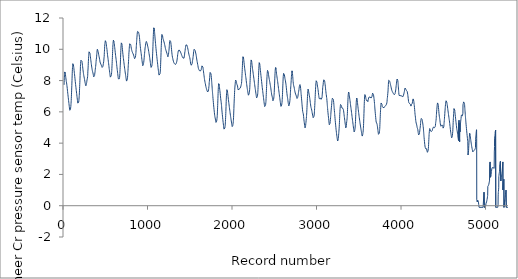
| Category | Series 0 |
|---|---|
| 0.0 | 7.725 |
| 1.0 | 7.857 |
| 2.0 | 7.993 |
| 3.0 | 8.11 |
| 4.0 | 8.21 |
| 5.0 | 8.3 |
| 6.0 | 8.38 |
| 7.0 | 8.47 |
| 8.0 | 8.55 |
| 9.0 | 8.58 |
| 10.0 | 8.59 |
| 11.0 | 8.58 |
| 12.0 | 8.56 |
| 13.0 | 8.54 |
| 14.0 | 8.51 |
| 15.0 | 8.46 |
| 16.0 | 8.42 |
| 17.0 | 8.37 |
| 18.0 | 8.32 |
| 19.0 | 8.28 |
| 20.0 | 8.23 |
| 21.0 | 8.18 |
| 22.0 | 8.14 |
| 23.0 | 8.1 |
| 24.0 | 8.06 |
| 25.0 | 8.02 |
| 26.0 | 7.978 |
| 27.0 | 7.944 |
| 28.0 | 7.92 |
| 29.0 | 7.887 |
| 30.0 | 7.851 |
| 31.0 | 7.811 |
| 32.0 | 7.771 |
| 33.0 | 7.726 |
| 34.0 | 7.677 |
| 35.0 | 7.631 |
| 36.0 | 7.593 |
| 37.0 | 7.552 |
| 38.0 | 7.498 |
| 39.0 | 7.445 |
| 40.0 | 7.392 |
| 41.0 | 7.342 |
| 42.0 | 7.293 |
| 43.0 | 7.244 |
| 44.0 | 7.194 |
| 45.0 | 7.146 |
| 46.0 | 7.098 |
| 47.0 | 7.051 |
| 48.0 | 7.004 |
| 49.0 | 6.956 |
| 50.0 | 6.908 |
| 51.0 | 6.861 |
| 52.0 | 6.814 |
| 53.0 | 6.767 |
| 54.0 | 6.719 |
| 55.0 | 6.672 |
| 56.0 | 6.626 |
| 57.0 | 6.579 |
| 58.0 | 6.533 |
| 59.0 | 6.484 |
| 60.0 | 6.436 |
| 61.0 | 6.388 |
| 62.0 | 6.344 |
| 63.0 | 6.296 |
| 64.0 | 6.253 |
| 65.0 | 6.208 |
| 66.0 | 6.165 |
| 67.0 | 6.127 |
| 68.0 | 6.1 |
| 69.0 | 6.097 |
| 70.0 | 6.098 |
| 71.0 | 6.104 |
| 72.0 | 6.11 |
| 73.0 | 6.117 |
| 74.0 | 6.13 |
| 75.0 | 6.15 |
| 76.0 | 6.174 |
| 77.0 | 6.206 |
| 78.0 | 6.244 |
| 79.0 | 6.286 |
| 80.0 | 6.339 |
| 81.0 | 6.4 |
| 82.0 | 6.472 |
| 83.0 | 6.548 |
| 84.0 | 6.636 |
| 85.0 | 6.738 |
| 86.0 | 6.864 |
| 87.0 | 6.996 |
| 88.0 | 7.128 |
| 89.0 | 7.258 |
| 90.0 | 7.39 |
| 91.0 | 7.53 |
| 92.0 | 7.677 |
| 93.0 | 7.839 |
| 94.0 | 7.999 |
| 95.0 | 8.15 |
| 96.0 | 8.3 |
| 97.0 | 8.47 |
| 98.0 | 8.6 |
| 99.0 | 8.72 |
| 100.0 | 8.83 |
| 101.0 | 8.91 |
| 102.0 | 8.98 |
| 103.0 | 9.04 |
| 104.0 | 9.08 |
| 105.0 | 9.11 |
| 106.0 | 9.12 |
| 107.0 | 9.11 |
| 108.0 | 9.09 |
| 109.0 | 9.07 |
| 110.0 | 9.04 |
| 111.0 | 9 |
| 112.0 | 8.96 |
| 113.0 | 8.92 |
| 114.0 | 8.89 |
| 115.0 | 8.84 |
| 116.0 | 8.8 |
| 117.0 | 8.75 |
| 118.0 | 8.7 |
| 119.0 | 8.64 |
| 120.0 | 8.59 |
| 121.0 | 8.54 |
| 122.0 | 8.49 |
| 123.0 | 8.45 |
| 124.0 | 8.41 |
| 125.0 | 8.36 |
| 126.0 | 8.31 |
| 127.0 | 8.25 |
| 128.0 | 8.2 |
| 129.0 | 8.15 |
| 130.0 | 8.09 |
| 131.0 | 8.04 |
| 132.0 | 7.984 |
| 133.0 | 7.934 |
| 134.0 | 7.886 |
| 135.0 | 7.84 |
| 136.0 | 7.79 |
| 137.0 | 7.741 |
| 138.0 | 7.692 |
| 139.0 | 7.644 |
| 140.0 | 7.596 |
| 141.0 | 7.549 |
| 142.0 | 7.5 |
| 143.0 | 7.453 |
| 144.0 | 7.408 |
| 145.0 | 7.361 |
| 146.0 | 7.316 |
| 147.0 | 7.27 |
| 148.0 | 7.223 |
| 149.0 | 7.177 |
| 150.0 | 7.133 |
| 151.0 | 7.087 |
| 152.0 | 7.04 |
| 153.0 | 6.994 |
| 154.0 | 6.949 |
| 155.0 | 6.902 |
| 156.0 | 6.857 |
| 157.0 | 6.811 |
| 158.0 | 6.765 |
| 159.0 | 6.721 |
| 160.0 | 6.676 |
| 161.0 | 6.632 |
| 162.0 | 6.592 |
| 163.0 | 6.557 |
| 164.0 | 6.53 |
| 165.0 | 6.524 |
| 166.0 | 6.524 |
| 167.0 | 6.531 |
| 168.0 | 6.538 |
| 169.0 | 6.548 |
| 170.0 | 6.56 |
| 171.0 | 6.58 |
| 172.0 | 6.603 |
| 173.0 | 6.629 |
| 174.0 | 6.666 |
| 175.0 | 6.707 |
| 176.0 | 6.757 |
| 177.0 | 6.815 |
| 178.0 | 6.887 |
| 179.0 | 6.961 |
| 180.0 | 7.042 |
| 181.0 | 7.141 |
| 182.0 | 7.259 |
| 183.0 | 7.385 |
| 184.0 | 7.507 |
| 185.0 | 7.63 |
| 186.0 | 7.757 |
| 187.0 | 7.888 |
| 188.0 | 8.02 |
| 189.0 | 8.16 |
| 190.0 | 8.33 |
| 191.0 | 8.48 |
| 192.0 | 8.59 |
| 193.0 | 8.74 |
| 194.0 | 8.9 |
| 195.0 | 9.01 |
| 196.0 | 9.09 |
| 197.0 | 9.14 |
| 198.0 | 9.21 |
| 199.0 | 9.25 |
| 200.0 | 9.3 |
| 201.0 | 9.31 |
| 202.0 | 9.33 |
| 203.0 | 9.35 |
| 204.0 | 9.36 |
| 205.0 | 9.36 |
| 206.0 | 9.36 |
| 207.0 | 9.35 |
| 208.0 | 9.33 |
| 209.0 | 9.32 |
| 210.0 | 9.3 |
| 211.0 | 9.26 |
| 212.0 | 9.23 |
| 213.0 | 9.19 |
| 214.0 | 9.15 |
| 215.0 | 9.1 |
| 216.0 | 9.06 |
| 217.0 | 9.02 |
| 218.0 | 8.97 |
| 219.0 | 8.92 |
| 220.0 | 8.88 |
| 221.0 | 8.83 |
| 222.0 | 8.79 |
| 223.0 | 8.74 |
| 224.0 | 8.69 |
| 225.0 | 8.65 |
| 226.0 | 8.61 |
| 227.0 | 8.57 |
| 228.0 | 8.53 |
| 229.0 | 8.49 |
| 230.0 | 8.45 |
| 231.0 | 8.41 |
| 232.0 | 8.38 |
| 233.0 | 8.34 |
| 234.0 | 8.31 |
| 235.0 | 8.29 |
| 236.0 | 8.26 |
| 237.0 | 8.23 |
| 238.0 | 8.2 |
| 239.0 | 8.18 |
| 240.0 | 8.15 |
| 241.0 | 8.12 |
| 242.0 | 8.09 |
| 243.0 | 8.06 |
| 244.0 | 8.03 |
| 245.0 | 8 |
| 246.0 | 7.965 |
| 247.0 | 7.929 |
| 248.0 | 7.899 |
| 249.0 | 7.875 |
| 250.0 | 7.851 |
| 251.0 | 7.82 |
| 252.0 | 7.79 |
| 253.0 | 7.76 |
| 254.0 | 7.731 |
| 255.0 | 7.711 |
| 256.0 | 7.698 |
| 257.0 | 7.683 |
| 258.0 | 7.667 |
| 259.0 | 7.667 |
| 260.0 | 7.667 |
| 261.0 | 7.69 |
| 262.0 | 7.709 |
| 263.0 | 7.721 |
| 264.0 | 7.747 |
| 265.0 | 7.779 |
| 266.0 | 7.817 |
| 267.0 | 7.856 |
| 268.0 | 7.883 |
| 269.0 | 7.92 |
| 270.0 | 7.963 |
| 271.0 | 7.988 |
| 272.0 | 8.04 |
| 273.0 | 8.07 |
| 274.0 | 8.09 |
| 275.0 | 8.1 |
| 276.0 | 8.15 |
| 277.0 | 8.19 |
| 278.0 | 8.21 |
| 279.0 | 8.25 |
| 280.0 | 8.34 |
| 281.0 | 8.47 |
| 282.0 | 8.6 |
| 283.0 | 8.65 |
| 284.0 | 8.74 |
| 285.0 | 8.86 |
| 286.0 | 8.96 |
| 287.0 | 9.11 |
| 288.0 | 9.22 |
| 289.0 | 9.31 |
| 290.0 | 9.42 |
| 291.0 | 9.53 |
| 292.0 | 9.61 |
| 293.0 | 9.68 |
| 294.0 | 9.75 |
| 295.0 | 9.8 |
| 296.0 | 9.84 |
| 297.0 | 9.86 |
| 298.0 | 9.86 |
| 299.0 | 9.86 |
| 300.0 | 9.85 |
| 301.0 | 9.86 |
| 302.0 | 9.86 |
| 303.0 | 9.84 |
| 304.0 | 9.82 |
| 305.0 | 9.79 |
| 306.0 | 9.76 |
| 307.0 | 9.73 |
| 308.0 | 9.69 |
| 309.0 | 9.65 |
| 310.0 | 9.61 |
| 311.0 | 9.56 |
| 312.0 | 9.52 |
| 313.0 | 9.48 |
| 314.0 | 9.43 |
| 315.0 | 9.39 |
| 316.0 | 9.34 |
| 317.0 | 9.3 |
| 318.0 | 9.26 |
| 319.0 | 9.21 |
| 320.0 | 9.17 |
| 321.0 | 9.13 |
| 322.0 | 9.09 |
| 323.0 | 9.05 |
| 324.0 | 9.01 |
| 325.0 | 8.97 |
| 326.0 | 8.93 |
| 327.0 | 8.9 |
| 328.0 | 8.86 |
| 329.0 | 8.83 |
| 330.0 | 8.79 |
| 331.0 | 8.76 |
| 332.0 | 8.72 |
| 333.0 | 8.69 |
| 334.0 | 8.66 |
| 335.0 | 8.64 |
| 336.0 | 8.62 |
| 337.0 | 8.6 |
| 338.0 | 8.57 |
| 339.0 | 8.55 |
| 340.0 | 8.53 |
| 341.0 | 8.51 |
| 342.0 | 8.49 |
| 343.0 | 8.46 |
| 344.0 | 8.43 |
| 345.0 | 8.41 |
| 346.0 | 8.38 |
| 347.0 | 8.35 |
| 348.0 | 8.32 |
| 349.0 | 8.29 |
| 350.0 | 8.27 |
| 351.0 | 8.24 |
| 352.0 | 8.23 |
| 353.0 | 8.21 |
| 354.0 | 8.2 |
| 355.0 | 8.19 |
| 356.0 | 8.2 |
| 357.0 | 8.23 |
| 358.0 | 8.24 |
| 359.0 | 8.25 |
| 360.0 | 8.29 |
| 361.0 | 8.32 |
| 362.0 | 8.37 |
| 363.0 | 8.41 |
| 364.0 | 8.44 |
| 365.0 | 8.49 |
| 366.0 | 8.52 |
| 367.0 | 8.56 |
| 368.0 | 8.63 |
| 369.0 | 8.69 |
| 370.0 | 8.73 |
| 371.0 | 8.77 |
| 372.0 | 8.83 |
| 373.0 | 8.89 |
| 374.0 | 8.91 |
| 375.0 | 8.96 |
| 376.0 | 9 |
| 377.0 | 9.07 |
| 378.0 | 9.14 |
| 379.0 | 9.22 |
| 380.0 | 9.24 |
| 381.0 | 9.33 |
| 382.0 | 9.37 |
| 383.0 | 9.38 |
| 384.0 | 9.45 |
| 385.0 | 9.51 |
| 386.0 | 9.56 |
| 387.0 | 9.65 |
| 388.0 | 9.73 |
| 389.0 | 9.8 |
| 390.0 | 9.85 |
| 391.0 | 9.89 |
| 392.0 | 9.92 |
| 393.0 | 9.95 |
| 394.0 | 10 |
| 395.0 | 9.98 |
| 396.0 | 9.97 |
| 397.0 | 9.96 |
| 398.0 | 9.95 |
| 399.0 | 9.94 |
| 400.0 | 9.92 |
| 401.0 | 9.91 |
| 402.0 | 9.88 |
| 403.0 | 9.85 |
| 404.0 | 9.82 |
| 405.0 | 9.79 |
| 406.0 | 9.76 |
| 407.0 | 9.74 |
| 408.0 | 9.71 |
| 409.0 | 9.68 |
| 410.0 | 9.66 |
| 411.0 | 9.63 |
| 412.0 | 9.6 |
| 413.0 | 9.58 |
| 414.0 | 9.55 |
| 415.0 | 9.52 |
| 416.0 | 9.5 |
| 417.0 | 9.47 |
| 418.0 | 9.44 |
| 419.0 | 9.41 |
| 420.0 | 9.38 |
| 421.0 | 9.36 |
| 422.0 | 9.33 |
| 423.0 | 9.3 |
| 424.0 | 9.26 |
| 425.0 | 9.23 |
| 426.0 | 9.19 |
| 427.0 | 9.17 |
| 428.0 | 9.15 |
| 429.0 | 9.13 |
| 430.0 | 9.12 |
| 431.0 | 9.1 |
| 432.0 | 9.09 |
| 433.0 | 9.08 |
| 434.0 | 9.07 |
| 435.0 | 9.06 |
| 436.0 | 9.05 |
| 437.0 | 9.04 |
| 438.0 | 9.03 |
| 439.0 | 9.01 |
| 440.0 | 8.99 |
| 441.0 | 8.98 |
| 442.0 | 8.97 |
| 443.0 | 8.95 |
| 444.0 | 8.94 |
| 445.0 | 8.92 |
| 446.0 | 8.91 |
| 447.0 | 8.9 |
| 448.0 | 8.89 |
| 449.0 | 8.88 |
| 450.0 | 8.86 |
| 451.0 | 8.84 |
| 452.0 | 8.84 |
| 453.0 | 8.84 |
| 454.0 | 8.84 |
| 455.0 | 8.86 |
| 456.0 | 8.86 |
| 457.0 | 8.87 |
| 458.0 | 8.88 |
| 459.0 | 8.9 |
| 460.0 | 8.91 |
| 461.0 | 8.93 |
| 462.0 | 8.97 |
| 463.0 | 9 |
| 464.0 | 9.05 |
| 465.0 | 9.08 |
| 466.0 | 9.08 |
| 467.0 | 9.1 |
| 468.0 | 9.14 |
| 469.0 | 9.2 |
| 470.0 | 9.25 |
| 471.0 | 9.31 |
| 472.0 | 9.38 |
| 473.0 | 9.45 |
| 474.0 | 9.48 |
| 475.0 | 9.53 |
| 476.0 | 9.67 |
| 477.0 | 9.78 |
| 478.0 | 9.87 |
| 479.0 | 9.97 |
| 480.0 | 10.07 |
| 481.0 | 10.17 |
| 482.0 | 10.29 |
| 483.0 | 10.33 |
| 484.0 | 10.36 |
| 485.0 | 10.41 |
| 486.0 | 10.46 |
| 487.0 | 10.49 |
| 488.0 | 10.51 |
| 489.0 | 10.55 |
| 490.0 | 10.58 |
| 491.0 | 10.6 |
| 492.0 | 10.6 |
| 493.0 | 10.58 |
| 494.0 | 10.55 |
| 495.0 | 10.52 |
| 496.0 | 10.49 |
| 497.0 | 10.45 |
| 498.0 | 10.41 |
| 499.0 | 10.37 |
| 500.0 | 10.33 |
| 501.0 | 10.28 |
| 502.0 | 10.23 |
| 503.0 | 10.18 |
| 504.0 | 10.14 |
| 505.0 | 10.11 |
| 506.0 | 10.08 |
| 507.0 | 10.05 |
| 508.0 | 9.99 |
| 509.0 | 9.93 |
| 510.0 | 9.88 |
| 511.0 | 9.83 |
| 512.0 | 9.78 |
| 513.0 | 9.73 |
| 514.0 | 9.68 |
| 515.0 | 9.63 |
| 516.0 | 9.58 |
| 517.0 | 9.54 |
| 518.0 | 9.5 |
| 519.0 | 9.46 |
| 520.0 | 9.42 |
| 521.0 | 9.38 |
| 522.0 | 9.34 |
| 523.0 | 9.29 |
| 524.0 | 9.24 |
| 525.0 | 9.19 |
| 526.0 | 9.15 |
| 527.0 | 9.11 |
| 528.0 | 9.07 |
| 529.0 | 9.02 |
| 530.0 | 8.97 |
| 531.0 | 8.92 |
| 532.0 | 8.88 |
| 533.0 | 8.83 |
| 534.0 | 8.78 |
| 535.0 | 8.74 |
| 536.0 | 8.7 |
| 537.0 | 8.66 |
| 538.0 | 8.62 |
| 539.0 | 8.58 |
| 540.0 | 8.53 |
| 541.0 | 8.49 |
| 542.0 | 8.45 |
| 543.0 | 8.41 |
| 544.0 | 8.37 |
| 545.0 | 8.33 |
| 546.0 | 8.29 |
| 547.0 | 8.25 |
| 548.0 | 8.22 |
| 549.0 | 8.21 |
| 550.0 | 8.2 |
| 551.0 | 8.2 |
| 552.0 | 8.2 |
| 553.0 | 8.2 |
| 554.0 | 8.21 |
| 555.0 | 8.22 |
| 556.0 | 8.23 |
| 557.0 | 8.25 |
| 558.0 | 8.28 |
| 559.0 | 8.32 |
| 560.0 | 8.35 |
| 561.0 | 8.4 |
| 562.0 | 8.45 |
| 563.0 | 8.51 |
| 564.0 | 8.58 |
| 565.0 | 8.65 |
| 566.0 | 8.76 |
| 567.0 | 8.87 |
| 568.0 | 8.98 |
| 569.0 | 9.09 |
| 570.0 | 9.22 |
| 571.0 | 9.35 |
| 572.0 | 9.46 |
| 573.0 | 9.6 |
| 574.0 | 9.73 |
| 575.0 | 9.86 |
| 576.0 | 9.98 |
| 577.0 | 10.1 |
| 578.0 | 10.21 |
| 579.0 | 10.3 |
| 580.0 | 10.38 |
| 581.0 | 10.44 |
| 582.0 | 10.5 |
| 583.0 | 10.54 |
| 584.0 | 10.58 |
| 585.0 | 10.61 |
| 586.0 | 10.59 |
| 587.0 | 10.59 |
| 588.0 | 10.55 |
| 589.0 | 10.52 |
| 590.0 | 10.5 |
| 591.0 | 10.47 |
| 592.0 | 10.43 |
| 593.0 | 10.4 |
| 594.0 | 10.36 |
| 595.0 | 10.31 |
| 596.0 | 10.27 |
| 597.0 | 10.23 |
| 598.0 | 10.18 |
| 599.0 | 10.14 |
| 600.0 | 10.1 |
| 601.0 | 10.05 |
| 602.0 | 10 |
| 603.0 | 9.95 |
| 604.0 | 9.9 |
| 605.0 | 9.85 |
| 606.0 | 9.8 |
| 607.0 | 9.75 |
| 608.0 | 9.7 |
| 609.0 | 9.66 |
| 610.0 | 9.61 |
| 611.0 | 9.57 |
| 612.0 | 9.52 |
| 613.0 | 9.48 |
| 614.0 | 9.44 |
| 615.0 | 9.4 |
| 616.0 | 9.36 |
| 617.0 | 9.31 |
| 618.0 | 9.27 |
| 619.0 | 9.23 |
| 620.0 | 9.18 |
| 621.0 | 9.14 |
| 622.0 | 9.08 |
| 623.0 | 9.01 |
| 624.0 | 8.96 |
| 625.0 | 8.91 |
| 626.0 | 8.85 |
| 627.0 | 8.81 |
| 628.0 | 8.76 |
| 629.0 | 8.72 |
| 630.0 | 8.68 |
| 631.0 | 8.63 |
| 632.0 | 8.58 |
| 633.0 | 8.54 |
| 634.0 | 8.49 |
| 635.0 | 8.45 |
| 636.0 | 8.4 |
| 637.0 | 8.36 |
| 638.0 | 8.31 |
| 639.0 | 8.27 |
| 640.0 | 8.23 |
| 641.0 | 8.18 |
| 642.0 | 8.15 |
| 643.0 | 8.11 |
| 644.0 | 8.07 |
| 645.0 | 8.06 |
| 646.0 | 8.06 |
| 647.0 | 8.05 |
| 648.0 | 8.05 |
| 649.0 | 8.05 |
| 650.0 | 8.05 |
| 651.0 | 8.05 |
| 652.0 | 8.06 |
| 653.0 | 8.07 |
| 654.0 | 8.09 |
| 655.0 | 8.12 |
| 656.0 | 8.15 |
| 657.0 | 8.19 |
| 658.0 | 8.24 |
| 659.0 | 8.3 |
| 660.0 | 8.36 |
| 661.0 | 8.45 |
| 662.0 | 8.56 |
| 663.0 | 8.7 |
| 664.0 | 8.82 |
| 665.0 | 8.94 |
| 666.0 | 9.06 |
| 667.0 | 9.19 |
| 668.0 | 9.33 |
| 669.0 | 9.49 |
| 670.0 | 9.64 |
| 671.0 | 9.78 |
| 672.0 | 9.91 |
| 673.0 | 10.03 |
| 674.0 | 10.14 |
| 675.0 | 10.23 |
| 676.0 | 10.3 |
| 677.0 | 10.36 |
| 678.0 | 10.41 |
| 679.0 | 10.45 |
| 680.0 | 10.47 |
| 681.0 | 10.47 |
| 682.0 | 10.46 |
| 683.0 | 10.42 |
| 684.0 | 10.39 |
| 685.0 | 10.34 |
| 686.0 | 10.28 |
| 687.0 | 10.23 |
| 688.0 | 10.17 |
| 689.0 | 10.11 |
| 690.0 | 10.05 |
| 691.0 | 10 |
| 692.0 | 9.94 |
| 693.0 | 9.88 |
| 694.0 | 9.83 |
| 695.0 | 9.77 |
| 696.0 | 9.72 |
| 697.0 | 9.67 |
| 698.0 | 9.61 |
| 699.0 | 9.57 |
| 700.0 | 9.52 |
| 701.0 | 9.48 |
| 702.0 | 9.44 |
| 703.0 | 9.4 |
| 704.0 | 9.35 |
| 705.0 | 9.31 |
| 706.0 | 9.26 |
| 707.0 | 9.22 |
| 708.0 | 9.17 |
| 709.0 | 9.13 |
| 710.0 | 9.09 |
| 711.0 | 9.05 |
| 712.0 | 9 |
| 713.0 | 8.96 |
| 714.0 | 8.91 |
| 715.0 | 8.87 |
| 716.0 | 8.83 |
| 717.0 | 8.79 |
| 718.0 | 8.75 |
| 719.0 | 8.71 |
| 720.0 | 8.67 |
| 721.0 | 8.63 |
| 722.0 | 8.59 |
| 723.0 | 8.55 |
| 724.0 | 8.52 |
| 725.0 | 8.48 |
| 726.0 | 8.44 |
| 727.0 | 8.4 |
| 728.0 | 8.37 |
| 729.0 | 8.33 |
| 730.0 | 8.29 |
| 731.0 | 8.25 |
| 732.0 | 8.22 |
| 733.0 | 8.18 |
| 734.0 | 8.14 |
| 735.0 | 8.11 |
| 736.0 | 8.07 |
| 737.0 | 8.03 |
| 738.0 | 8 |
| 739.0 | 7.98 |
| 740.0 | 7.966 |
| 741.0 | 7.971 |
| 742.0 | 7.981 |
| 743.0 | 7.993 |
| 744.0 | 8 |
| 745.0 | 8.03 |
| 746.0 | 8.04 |
| 747.0 | 8.07 |
| 748.0 | 8.08 |
| 749.0 | 8.11 |
| 750.0 | 8.14 |
| 751.0 | 8.18 |
| 752.0 | 8.23 |
| 753.0 | 8.31 |
| 754.0 | 8.43 |
| 755.0 | 8.51 |
| 756.0 | 8.58 |
| 757.0 | 8.66 |
| 758.0 | 8.76 |
| 759.0 | 8.86 |
| 760.0 | 8.95 |
| 761.0 | 9.04 |
| 762.0 | 9.12 |
| 763.0 | 9.22 |
| 764.0 | 9.34 |
| 765.0 | 9.42 |
| 766.0 | 9.54 |
| 767.0 | 9.68 |
| 768.0 | 9.78 |
| 769.0 | 9.82 |
| 770.0 | 9.89 |
| 771.0 | 9.99 |
| 772.0 | 10.07 |
| 773.0 | 10.16 |
| 774.0 | 10.22 |
| 775.0 | 10.25 |
| 776.0 | 10.31 |
| 777.0 | 10.35 |
| 778.0 | 10.36 |
| 779.0 | 10.37 |
| 780.0 | 10.39 |
| 781.0 | 10.39 |
| 782.0 | 10.4 |
| 783.0 | 10.41 |
| 784.0 | 10.41 |
| 785.0 | 10.4 |
| 786.0 | 10.38 |
| 787.0 | 10.35 |
| 788.0 | 10.32 |
| 789.0 | 10.3 |
| 790.0 | 10.26 |
| 791.0 | 10.23 |
| 792.0 | 10.19 |
| 793.0 | 10.16 |
| 794.0 | 10.13 |
| 795.0 | 10.1 |
| 796.0 | 10.07 |
| 797.0 | 10.04 |
| 798.0 | 10.02 |
| 799.0 | 9.99 |
| 800.0 | 9.97 |
| 801.0 | 9.94 |
| 802.0 | 9.92 |
| 803.0 | 9.9 |
| 804.0 | 9.89 |
| 805.0 | 9.87 |
| 806.0 | 9.85 |
| 807.0 | 9.84 |
| 808.0 | 9.82 |
| 809.0 | 9.81 |
| 810.0 | 9.79 |
| 811.0 | 9.78 |
| 812.0 | 9.76 |
| 813.0 | 9.75 |
| 814.0 | 9.74 |
| 815.0 | 9.73 |
| 816.0 | 9.72 |
| 817.0 | 9.71 |
| 818.0 | 9.71 |
| 819.0 | 9.69 |
| 820.0 | 9.68 |
| 821.0 | 9.67 |
| 822.0 | 9.65 |
| 823.0 | 9.63 |
| 824.0 | 9.61 |
| 825.0 | 9.59 |
| 826.0 | 9.57 |
| 827.0 | 9.55 |
| 828.0 | 9.53 |
| 829.0 | 9.51 |
| 830.0 | 9.49 |
| 831.0 | 9.47 |
| 832.0 | 9.45 |
| 833.0 | 9.43 |
| 834.0 | 9.42 |
| 835.0 | 9.4 |
| 836.0 | 9.4 |
| 837.0 | 9.4 |
| 838.0 | 9.4 |
| 839.0 | 9.4 |
| 840.0 | 9.41 |
| 841.0 | 9.41 |
| 842.0 | 9.43 |
| 843.0 | 9.45 |
| 844.0 | 9.5 |
| 845.0 | 9.51 |
| 846.0 | 9.55 |
| 847.0 | 9.59 |
| 848.0 | 9.61 |
| 849.0 | 9.65 |
| 850.0 | 9.73 |
| 851.0 | 9.81 |
| 852.0 | 9.89 |
| 853.0 | 9.98 |
| 854.0 | 10.08 |
| 855.0 | 10.16 |
| 856.0 | 10.24 |
| 857.0 | 10.33 |
| 858.0 | 10.42 |
| 859.0 | 10.5 |
| 860.0 | 10.57 |
| 861.0 | 10.64 |
| 862.0 | 10.73 |
| 863.0 | 10.78 |
| 864.0 | 10.85 |
| 865.0 | 10.93 |
| 866.0 | 10.98 |
| 867.0 | 11.05 |
| 868.0 | 11.09 |
| 869.0 | 11.1 |
| 870.0 | 11.14 |
| 871.0 | 11.16 |
| 872.0 | 11.16 |
| 873.0 | 11.18 |
| 874.0 | 11.18 |
| 875.0 | 11.16 |
| 876.0 | 11.15 |
| 877.0 | 11.15 |
| 878.0 | 11.14 |
| 879.0 | 11.12 |
| 880.0 | 11.11 |
| 881.0 | 11.1 |
| 882.0 | 11.09 |
| 883.0 | 11.09 |
| 884.0 | 11.07 |
| 885.0 | 11.01 |
| 886.0 | 10.98 |
| 887.0 | 10.97 |
| 888.0 | 10.94 |
| 889.0 | 10.92 |
| 890.0 | 10.89 |
| 891.0 | 10.84 |
| 892.0 | 10.79 |
| 893.0 | 10.74 |
| 894.0 | 10.68 |
| 895.0 | 10.62 |
| 896.0 | 10.56 |
| 897.0 | 10.49 |
| 898.0 | 10.43 |
| 899.0 | 10.37 |
| 900.0 | 10.31 |
| 901.0 | 10.26 |
| 902.0 | 10.21 |
| 903.0 | 10.16 |
| 904.0 | 10.1 |
| 905.0 | 10.05 |
| 906.0 | 10.01 |
| 907.0 | 9.96 |
| 908.0 | 9.92 |
| 909.0 | 9.88 |
| 910.0 | 9.84 |
| 911.0 | 9.8 |
| 912.0 | 9.76 |
| 913.0 | 9.72 |
| 914.0 | 9.68 |
| 915.0 | 9.63 |
| 916.0 | 9.59 |
| 917.0 | 9.54 |
| 918.0 | 9.5 |
| 919.0 | 9.45 |
| 920.0 | 9.41 |
| 921.0 | 9.36 |
| 922.0 | 9.32 |
| 923.0 | 9.27 |
| 924.0 | 9.23 |
| 925.0 | 9.19 |
| 926.0 | 9.15 |
| 927.0 | 9.11 |
| 928.0 | 9.06 |
| 929.0 | 9.02 |
| 930.0 | 8.99 |
| 931.0 | 8.95 |
| 932.0 | 8.92 |
| 933.0 | 8.9 |
| 934.0 | 8.91 |
| 935.0 | 8.93 |
| 936.0 | 8.93 |
| 937.0 | 8.95 |
| 938.0 | 8.99 |
| 939.0 | 9.02 |
| 940.0 | 9.06 |
| 941.0 | 9.1 |
| 942.0 | 9.13 |
| 943.0 | 9.17 |
| 944.0 | 9.22 |
| 945.0 | 9.26 |
| 946.0 | 9.32 |
| 947.0 | 9.38 |
| 948.0 | 9.43 |
| 949.0 | 9.49 |
| 950.0 | 9.58 |
| 951.0 | 9.65 |
| 952.0 | 9.68 |
| 953.0 | 9.72 |
| 954.0 | 9.75 |
| 955.0 | 9.84 |
| 956.0 | 9.92 |
| 957.0 | 9.97 |
| 958.0 | 10.02 |
| 959.0 | 10.09 |
| 960.0 | 10.13 |
| 961.0 | 10.15 |
| 962.0 | 10.17 |
| 963.0 | 10.22 |
| 964.0 | 10.26 |
| 965.0 | 10.31 |
| 966.0 | 10.35 |
| 967.0 | 10.38 |
| 968.0 | 10.4 |
| 969.0 | 10.43 |
| 970.0 | 10.45 |
| 971.0 | 10.46 |
| 972.0 | 10.48 |
| 973.0 | 10.49 |
| 974.0 | 10.5 |
| 975.0 | 10.49 |
| 976.0 | 10.49 |
| 977.0 | 10.48 |
| 978.0 | 10.46 |
| 979.0 | 10.44 |
| 980.0 | 10.42 |
| 981.0 | 10.4 |
| 982.0 | 10.38 |
| 983.0 | 10.36 |
| 984.0 | 10.34 |
| 985.0 | 10.31 |
| 986.0 | 10.29 |
| 987.0 | 10.27 |
| 988.0 | 10.25 |
| 989.0 | 10.22 |
| 990.0 | 10.2 |
| 991.0 | 10.17 |
| 992.0 | 10.16 |
| 993.0 | 10.13 |
| 994.0 | 10.11 |
| 995.0 | 10.08 |
| 996.0 | 10.05 |
| 997.0 | 10.01 |
| 998.0 | 9.99 |
| 999.0 | 9.96 |
| 1000.0 | 9.93 |
| 1001.0 | 9.9 |
| 1002.0 | 9.86 |
| 1003.0 | 9.82 |
| 1004.0 | 9.79 |
| 1005.0 | 9.75 |
| 1006.0 | 9.72 |
| 1007.0 | 9.69 |
| 1008.0 | 9.66 |
| 1009.0 | 9.63 |
| 1010.0 | 9.59 |
| 1011.0 | 9.56 |
| 1012.0 | 9.52 |
| 1013.0 | 9.48 |
| 1014.0 | 9.45 |
| 1015.0 | 9.4 |
| 1016.0 | 9.36 |
| 1017.0 | 9.32 |
| 1018.0 | 9.29 |
| 1019.0 | 9.25 |
| 1020.0 | 9.2 |
| 1021.0 | 9.16 |
| 1022.0 | 9.12 |
| 1023.0 | 9.08 |
| 1024.0 | 9.03 |
| 1025.0 | 8.99 |
| 1026.0 | 8.95 |
| 1027.0 | 8.91 |
| 1028.0 | 8.87 |
| 1029.0 | 8.85 |
| 1030.0 | 8.84 |
| 1031.0 | 8.84 |
| 1032.0 | 8.83 |
| 1033.0 | 8.83 |
| 1034.0 | 8.83 |
| 1035.0 | 8.84 |
| 1036.0 | 8.85 |
| 1037.0 | 8.87 |
| 1038.0 | 8.9 |
| 1039.0 | 8.93 |
| 1040.0 | 8.96 |
| 1041.0 | 9.01 |
| 1042.0 | 9.06 |
| 1043.0 | 9.11 |
| 1044.0 | 9.17 |
| 1045.0 | 9.25 |
| 1046.0 | 9.38 |
| 1047.0 | 9.51 |
| 1048.0 | 9.63 |
| 1049.0 | 9.75 |
| 1050.0 | 9.88 |
| 1051.0 | 10.02 |
| 1052.0 | 10.17 |
| 1053.0 | 10.33 |
| 1054.0 | 10.51 |
| 1055.0 | 10.65 |
| 1056.0 | 10.81 |
| 1057.0 | 10.94 |
| 1058.0 | 11.05 |
| 1059.0 | 11.16 |
| 1060.0 | 11.25 |
| 1061.0 | 11.31 |
| 1062.0 | 11.37 |
| 1063.0 | 11.4 |
| 1064.0 | 11.42 |
| 1065.0 | 11.42 |
| 1066.0 | 11.4 |
| 1067.0 | 11.36 |
| 1068.0 | 11.32 |
| 1069.0 | 11.26 |
| 1070.0 | 11.2 |
| 1071.0 | 11.13 |
| 1072.0 | 11.06 |
| 1073.0 | 10.99 |
| 1074.0 | 10.92 |
| 1075.0 | 10.86 |
| 1076.0 | 10.79 |
| 1077.0 | 10.73 |
| 1078.0 | 10.66 |
| 1079.0 | 10.6 |
| 1080.0 | 10.54 |
| 1081.0 | 10.47 |
| 1082.0 | 10.42 |
| 1083.0 | 10.36 |
| 1084.0 | 10.29 |
| 1085.0 | 10.23 |
| 1086.0 | 10.17 |
| 1087.0 | 10.12 |
| 1088.0 | 10.06 |
| 1089.0 | 10 |
| 1090.0 | 9.95 |
| 1091.0 | 9.89 |
| 1092.0 | 9.84 |
| 1093.0 | 9.79 |
| 1094.0 | 9.74 |
| 1095.0 | 9.68 |
| 1096.0 | 9.63 |
| 1097.0 | 9.58 |
| 1098.0 | 9.53 |
| 1099.0 | 9.48 |
| 1100.0 | 9.43 |
| 1101.0 | 9.38 |
| 1102.0 | 9.33 |
| 1103.0 | 9.28 |
| 1104.0 | 9.23 |
| 1105.0 | 9.18 |
| 1106.0 | 9.13 |
| 1107.0 | 9.08 |
| 1108.0 | 9.04 |
| 1109.0 | 8.99 |
| 1110.0 | 8.94 |
| 1111.0 | 8.89 |
| 1112.0 | 8.84 |
| 1113.0 | 8.8 |
| 1114.0 | 8.75 |
| 1115.0 | 8.71 |
| 1116.0 | 8.66 |
| 1117.0 | 8.62 |
| 1118.0 | 8.58 |
| 1119.0 | 8.54 |
| 1120.0 | 8.5 |
| 1121.0 | 8.46 |
| 1122.0 | 8.42 |
| 1123.0 | 8.39 |
| 1124.0 | 8.35 |
| 1125.0 | 8.33 |
| 1126.0 | 8.32 |
| 1127.0 | 8.32 |
| 1128.0 | 8.32 |
| 1129.0 | 8.31 |
| 1130.0 | 8.31 |
| 1131.0 | 8.32 |
| 1132.0 | 8.33 |
| 1133.0 | 8.35 |
| 1134.0 | 8.37 |
| 1135.0 | 8.41 |
| 1136.0 | 8.44 |
| 1137.0 | 8.49 |
| 1138.0 | 8.54 |
| 1139.0 | 8.61 |
| 1140.0 | 8.68 |
| 1141.0 | 8.77 |
| 1142.0 | 8.89 |
| 1143.0 | 9.04 |
| 1144.0 | 9.18 |
| 1145.0 | 9.32 |
| 1146.0 | 9.48 |
| 1147.0 | 9.63 |
| 1148.0 | 9.79 |
| 1149.0 | 9.96 |
| 1150.0 | 10.12 |
| 1151.0 | 10.26 |
| 1152.0 | 10.39 |
| 1153.0 | 10.54 |
| 1154.0 | 10.67 |
| 1155.0 | 10.77 |
| 1156.0 | 10.85 |
| 1157.0 | 10.91 |
| 1158.0 | 10.95 |
| 1159.0 | 11 |
| 1160.0 | 11.01 |
| 1161.0 | 11.01 |
| 1162.0 | 11 |
| 1163.0 | 10.96 |
| 1164.0 | 10.92 |
| 1165.0 | 10.9 |
| 1166.0 | 10.87 |
| 1167.0 | 10.82 |
| 1168.0 | 10.78 |
| 1169.0 | 10.74 |
| 1170.0 | 10.7 |
| 1171.0 | 10.67 |
| 1172.0 | 10.65 |
| 1173.0 | 10.64 |
| 1174.0 | 10.64 |
| 1175.0 | 10.62 |
| 1176.0 | 10.61 |
| 1177.0 | 10.59 |
| 1178.0 | 10.56 |
| 1179.0 | 10.54 |
| 1180.0 | 10.52 |
| 1181.0 | 10.5 |
| 1182.0 | 10.49 |
| 1183.0 | 10.47 |
| 1184.0 | 10.46 |
| 1185.0 | 10.45 |
| 1186.0 | 10.41 |
| 1187.0 | 10.39 |
| 1188.0 | 10.36 |
| 1189.0 | 10.34 |
| 1190.0 | 10.31 |
| 1191.0 | 10.29 |
| 1192.0 | 10.27 |
| 1193.0 | 10.26 |
| 1194.0 | 10.22 |
| 1195.0 | 10.19 |
| 1196.0 | 10.16 |
| 1197.0 | 10.13 |
| 1198.0 | 10.1 |
| 1199.0 | 10.08 |
| 1200.0 | 10.05 |
| 1201.0 | 10.04 |
| 1202.0 | 10.01 |
| 1203.0 | 9.99 |
| 1204.0 | 9.97 |
| 1205.0 | 9.96 |
| 1206.0 | 9.94 |
| 1207.0 | 9.92 |
| 1208.0 | 9.9 |
| 1209.0 | 9.88 |
| 1210.0 | 9.86 |
| 1211.0 | 9.84 |
| 1212.0 | 9.83 |
| 1213.0 | 9.81 |
| 1214.0 | 9.79 |
| 1215.0 | 9.78 |
| 1216.0 | 9.77 |
| 1217.0 | 9.75 |
| 1218.0 | 9.74 |
| 1219.0 | 9.72 |
| 1220.0 | 9.69 |
| 1221.0 | 9.67 |
| 1222.0 | 9.65 |
| 1223.0 | 9.64 |
| 1224.0 | 9.61 |
| 1225.0 | 9.59 |
| 1226.0 | 9.57 |
| 1227.0 | 9.55 |
| 1228.0 | 9.54 |
| 1229.0 | 9.52 |
| 1230.0 | 9.51 |
| 1231.0 | 9.53 |
| 1232.0 | 9.56 |
| 1233.0 | 9.59 |
| 1234.0 | 9.63 |
| 1235.0 | 9.64 |
| 1236.0 | 9.66 |
| 1237.0 | 9.71 |
| 1238.0 | 9.78 |
| 1239.0 | 9.81 |
| 1240.0 | 9.86 |
| 1241.0 | 9.9 |
| 1242.0 | 9.94 |
| 1243.0 | 10.02 |
| 1244.0 | 10.07 |
| 1245.0 | 10.16 |
| 1246.0 | 10.24 |
| 1247.0 | 10.32 |
| 1248.0 | 10.39 |
| 1249.0 | 10.45 |
| 1250.0 | 10.49 |
| 1251.0 | 10.52 |
| 1252.0 | 10.53 |
| 1253.0 | 10.56 |
| 1254.0 | 10.57 |
| 1255.0 | 10.57 |
| 1256.0 | 10.58 |
| 1257.0 | 10.59 |
| 1258.0 | 10.59 |
| 1259.0 | 10.57 |
| 1260.0 | 10.55 |
| 1261.0 | 10.52 |
| 1262.0 | 10.49 |
| 1263.0 | 10.45 |
| 1264.0 | 10.41 |
| 1265.0 | 10.37 |
| 1266.0 | 10.32 |
| 1267.0 | 10.27 |
| 1268.0 | 10.21 |
| 1269.0 | 10.15 |
| 1270.0 | 10.1 |
| 1271.0 | 10.05 |
| 1272.0 | 10 |
| 1273.0 | 9.95 |
| 1274.0 | 9.88 |
| 1275.0 | 9.82 |
| 1276.0 | 9.77 |
| 1277.0 | 9.73 |
| 1278.0 | 9.68 |
| 1279.0 | 9.63 |
| 1280.0 | 9.59 |
| 1281.0 | 9.56 |
| 1282.0 | 9.53 |
| 1283.0 | 9.49 |
| 1284.0 | 9.47 |
| 1285.0 | 9.45 |
| 1286.0 | 9.43 |
| 1287.0 | 9.4 |
| 1288.0 | 9.37 |
| 1289.0 | 9.35 |
| 1290.0 | 9.32 |
| 1291.0 | 9.29 |
| 1292.0 | 9.27 |
| 1293.0 | 9.26 |
| 1294.0 | 9.24 |
| 1295.0 | 9.22 |
| 1296.0 | 9.2 |
| 1297.0 | 9.18 |
| 1298.0 | 9.17 |
| 1299.0 | 9.16 |
| 1300.0 | 9.14 |
| 1301.0 | 9.13 |
| 1302.0 | 9.12 |
| 1303.0 | 9.11 |
| 1304.0 | 9.1 |
| 1305.0 | 9.09 |
| 1306.0 | 9.09 |
| 1307.0 | 9.08 |
| 1308.0 | 9.07 |
| 1309.0 | 9.07 |
| 1310.0 | 9.06 |
| 1311.0 | 9.05 |
| 1312.0 | 9.05 |
| 1313.0 | 9.04 |
| 1314.0 | 9.04 |
| 1315.0 | 9.03 |
| 1316.0 | 9.03 |
| 1317.0 | 9.03 |
| 1318.0 | 9.02 |
| 1319.0 | 9.02 |
| 1320.0 | 9.02 |
| 1321.0 | 9.03 |
| 1322.0 | 9.03 |
| 1323.0 | 9.04 |
| 1324.0 | 9.04 |
| 1325.0 | 9.05 |
| 1326.0 | 9.06 |
| 1327.0 | 9.08 |
| 1328.0 | 9.09 |
| 1329.0 | 9.1 |
| 1330.0 | 9.13 |
| 1331.0 | 9.14 |
| 1332.0 | 9.17 |
| 1333.0 | 9.19 |
| 1334.0 | 9.22 |
| 1335.0 | 9.24 |
| 1336.0 | 9.27 |
| 1337.0 | 9.31 |
| 1338.0 | 9.34 |
| 1339.0 | 9.38 |
| 1340.0 | 9.43 |
| 1341.0 | 9.47 |
| 1342.0 | 9.53 |
| 1343.0 | 9.56 |
| 1344.0 | 9.59 |
| 1345.0 | 9.66 |
| 1346.0 | 9.72 |
| 1347.0 | 9.73 |
| 1348.0 | 9.76 |
| 1349.0 | 9.81 |
| 1350.0 | 9.84 |
| 1351.0 | 9.87 |
| 1352.0 | 9.89 |
| 1353.0 | 9.9 |
| 1354.0 | 9.9 |
| 1355.0 | 9.91 |
| 1356.0 | 9.91 |
| 1357.0 | 9.91 |
| 1358.0 | 9.92 |
| 1359.0 | 9.92 |
| 1360.0 | 9.94 |
| 1361.0 | 9.94 |
| 1362.0 | 9.96 |
| 1363.0 | 9.97 |
| 1364.0 | 9.96 |
| 1365.0 | 9.95 |
| 1366.0 | 9.95 |
| 1367.0 | 9.94 |
| 1368.0 | 9.93 |
| 1369.0 | 9.92 |
| 1370.0 | 9.91 |
| 1371.0 | 9.9 |
| 1372.0 | 9.89 |
| 1373.0 | 9.88 |
| 1374.0 | 9.87 |
| 1375.0 | 9.86 |
| 1376.0 | 9.85 |
| 1377.0 | 9.84 |
| 1378.0 | 9.82 |
| 1379.0 | 9.81 |
| 1380.0 | 9.8 |
| 1381.0 | 9.79 |
| 1382.0 | 9.78 |
| 1383.0 | 9.76 |
| 1384.0 | 9.75 |
| 1385.0 | 9.73 |
| 1386.0 | 9.72 |
| 1387.0 | 9.7 |
| 1388.0 | 9.68 |
| 1389.0 | 9.67 |
| 1390.0 | 9.66 |
| 1391.0 | 9.65 |
| 1392.0 | 9.63 |
| 1393.0 | 9.62 |
| 1394.0 | 9.6 |
| 1395.0 | 9.59 |
| 1396.0 | 9.57 |
| 1397.0 | 9.56 |
| 1398.0 | 9.55 |
| 1399.0 | 9.53 |
| 1400.0 | 9.52 |
| 1401.0 | 9.51 |
| 1402.0 | 9.5 |
| 1403.0 | 9.49 |
| 1404.0 | 9.49 |
| 1405.0 | 9.48 |
| 1406.0 | 9.47 |
| 1407.0 | 9.45 |
| 1408.0 | 9.44 |
| 1409.0 | 9.43 |
| 1410.0 | 9.42 |
| 1411.0 | 9.4 |
| 1412.0 | 9.4 |
| 1413.0 | 9.4 |
| 1414.0 | 9.39 |
| 1415.0 | 9.39 |
| 1416.0 | 9.39 |
| 1417.0 | 9.4 |
| 1418.0 | 9.41 |
| 1419.0 | 9.43 |
| 1420.0 | 9.45 |
| 1421.0 | 9.49 |
| 1422.0 | 9.51 |
| 1423.0 | 9.54 |
| 1424.0 | 9.58 |
| 1425.0 | 9.61 |
| 1426.0 | 9.64 |
| 1427.0 | 9.69 |
| 1428.0 | 9.76 |
| 1429.0 | 9.79 |
| 1430.0 | 9.82 |
| 1431.0 | 9.85 |
| 1432.0 | 9.89 |
| 1433.0 | 9.93 |
| 1434.0 | 9.98 |
| 1435.0 | 10.04 |
| 1436.0 | 10.08 |
| 1437.0 | 10.1 |
| 1438.0 | 10.12 |
| 1439.0 | 10.16 |
| 1440.0 | 10.2 |
| 1441.0 | 10.25 |
| 1442.0 | 10.26 |
| 1443.0 | 10.28 |
| 1444.0 | 10.3 |
| 1445.0 | 10.3 |
| 1446.0 | 10.31 |
| 1447.0 | 10.32 |
| 1448.0 | 10.33 |
| 1449.0 | 10.33 |
| 1450.0 | 10.33 |
| 1451.0 | 10.32 |
| 1452.0 | 10.31 |
| 1453.0 | 10.3 |
| 1454.0 | 10.28 |
| 1455.0 | 10.26 |
| 1456.0 | 10.25 |
| 1457.0 | 10.23 |
| 1458.0 | 10.2 |
| 1459.0 | 10.18 |
| 1460.0 | 10.15 |
| 1461.0 | 10.14 |
| 1462.0 | 10.11 |
| 1463.0 | 10.09 |
| 1464.0 | 10.07 |
| 1465.0 | 10.05 |
| 1466.0 | 10.01 |
| 1467.0 | 9.98 |
| 1468.0 | 9.96 |
| 1469.0 | 9.93 |
| 1470.0 | 9.9 |
| 1471.0 | 9.86 |
| 1472.0 | 9.83 |
| 1473.0 | 9.8 |
| 1474.0 | 9.77 |
| 1475.0 | 9.74 |
| 1476.0 | 9.71 |
| 1477.0 | 9.69 |
| 1478.0 | 9.66 |
| 1479.0 | 9.64 |
| 1480.0 | 9.62 |
| 1481.0 | 9.6 |
| 1482.0 | 9.58 |
| 1483.0 | 9.56 |
| 1484.0 | 9.54 |
| 1485.0 | 9.51 |
| 1486.0 | 9.5 |
| 1487.0 | 9.48 |
| 1488.0 | 9.46 |
| 1489.0 | 9.43 |
| 1490.0 | 9.41 |
| 1491.0 | 9.37 |
| 1492.0 | 9.34 |
| 1493.0 | 9.3 |
| 1494.0 | 9.26 |
| 1495.0 | 9.21 |
| 1496.0 | 9.16 |
| 1497.0 | 9.12 |
| 1498.0 | 9.09 |
| 1499.0 | 9.07 |
| 1500.0 | 9.05 |
| 1501.0 | 9.03 |
| 1502.0 | 9.02 |
| 1503.0 | 9.01 |
| 1504.0 | 9 |
| 1505.0 | 8.99 |
| 1506.0 | 8.98 |
| 1507.0 | 8.97 |
| 1508.0 | 8.96 |
| 1509.0 | 8.96 |
| 1510.0 | 8.96 |
| 1511.0 | 8.97 |
| 1512.0 | 8.97 |
| 1513.0 | 8.98 |
| 1514.0 | 9 |
| 1515.0 | 9.04 |
| 1516.0 | 9.09 |
| 1517.0 | 9.14 |
| 1518.0 | 9.2 |
| 1519.0 | 9.21 |
| 1520.0 | 9.23 |
| 1521.0 | 9.29 |
| 1522.0 | 9.32 |
| 1523.0 | 9.33 |
| 1524.0 | 9.37 |
| 1525.0 | 9.42 |
| 1526.0 | 9.46 |
| 1527.0 | 9.5 |
| 1528.0 | 9.54 |
| 1529.0 | 9.59 |
| 1530.0 | 9.64 |
| 1531.0 | 9.69 |
| 1532.0 | 9.76 |
| 1533.0 | 9.79 |
| 1534.0 | 9.85 |
| 1535.0 | 9.89 |
| 1536.0 | 9.93 |
| 1537.0 | 9.96 |
| 1538.0 | 9.98 |
| 1539.0 | 9.99 |
| 1540.0 | 10 |
| 1541.0 | 10.02 |
| 1542.0 | 10.03 |
| 1543.0 | 10.02 |
| 1544.0 | 10.03 |
| 1545.0 | 10.03 |
| 1546.0 | 10.01 |
| 1547.0 | 10 |
| 1548.0 | 9.99 |
| 1549.0 | 9.98 |
| 1550.0 | 9.96 |
| 1551.0 | 9.94 |
| 1552.0 | 9.91 |
| 1553.0 | 9.89 |
| 1554.0 | 9.86 |
| 1555.0 | 9.83 |
| 1556.0 | 9.81 |
| 1557.0 | 9.78 |
| 1558.0 | 9.76 |
| 1559.0 | 9.73 |
| 1560.0 | 9.71 |
| 1561.0 | 9.69 |
| 1562.0 | 9.67 |
| 1563.0 | 9.63 |
| 1564.0 | 9.6 |
| 1565.0 | 9.56 |
| 1566.0 | 9.52 |
| 1567.0 | 9.49 |
| 1568.0 | 9.45 |
| 1569.0 | 9.42 |
| 1570.0 | 9.38 |
| 1571.0 | 9.35 |
| 1572.0 | 9.31 |
| 1573.0 | 9.28 |
| 1574.0 | 9.25 |
| 1575.0 | 9.22 |
| 1576.0 | 9.19 |
| 1577.0 | 9.16 |
| 1578.0 | 9.13 |
| 1579.0 | 9.1 |
| 1580.0 | 9.07 |
| 1581.0 | 9.04 |
| 1582.0 | 9.01 |
| 1583.0 | 8.99 |
| 1584.0 | 8.96 |
| 1585.0 | 8.93 |
| 1586.0 | 8.9 |
| 1587.0 | 8.86 |
| 1588.0 | 8.83 |
| 1589.0 | 8.81 |
| 1590.0 | 8.78 |
| 1591.0 | 8.76 |
| 1592.0 | 8.75 |
| 1593.0 | 8.73 |
| 1594.0 | 8.72 |
| 1595.0 | 8.71 |
| 1596.0 | 8.7 |
| 1597.0 | 8.68 |
| 1598.0 | 8.67 |
| 1599.0 | 8.66 |
| 1600.0 | 8.65 |
| 1601.0 | 8.64 |
| 1602.0 | 8.63 |
| 1603.0 | 8.62 |
| 1604.0 | 8.61 |
| 1605.0 | 8.61 |
| 1606.0 | 8.6 |
| 1607.0 | 8.6 |
| 1608.0 | 8.6 |
| 1609.0 | 8.6 |
| 1610.0 | 8.6 |
| 1611.0 | 8.6 |
| 1612.0 | 8.6 |
| 1613.0 | 8.61 |
| 1614.0 | 8.62 |
| 1615.0 | 8.63 |
| 1616.0 | 8.64 |
| 1617.0 | 8.63 |
| 1618.0 | 8.65 |
| 1619.0 | 8.66 |
| 1620.0 | 8.67 |
| 1621.0 | 8.66 |
| 1622.0 | 8.67 |
| 1623.0 | 8.69 |
| 1624.0 | 8.73 |
| 1625.0 | 8.76 |
| 1626.0 | 8.78 |
| 1627.0 | 8.81 |
| 1628.0 | 8.84 |
| 1629.0 | 8.86 |
| 1630.0 | 8.88 |
| 1631.0 | 8.9 |
| 1632.0 | 8.94 |
| 1633.0 | 8.94 |
| 1634.0 | 8.97 |
| 1635.0 | 8.97 |
| 1636.0 | 8.97 |
| 1637.0 | 8.97 |
| 1638.0 | 8.96 |
| 1639.0 | 8.96 |
| 1640.0 | 8.94 |
| 1641.0 | 8.92 |
| 1642.0 | 8.9 |
| 1643.0 | 8.87 |
| 1644.0 | 8.83 |
| 1645.0 | 8.79 |
| 1646.0 | 8.75 |
| 1647.0 | 8.71 |
| 1648.0 | 8.67 |
| 1649.0 | 8.63 |
| 1650.0 | 8.59 |
| 1651.0 | 8.55 |
| 1652.0 | 8.51 |
| 1653.0 | 8.46 |
| 1654.0 | 8.41 |
| 1655.0 | 8.37 |
| 1656.0 | 8.34 |
| 1657.0 | 8.3 |
| 1658.0 | 8.25 |
| 1659.0 | 8.21 |
| 1660.0 | 8.17 |
| 1661.0 | 8.13 |
| 1662.0 | 8.09 |
| 1663.0 | 8.06 |
| 1664.0 | 8.03 |
| 1665.0 | 8 |
| 1666.0 | 7.969 |
| 1667.0 | 7.939 |
| 1668.0 | 7.909 |
| 1669.0 | 7.876 |
| 1670.0 | 7.849 |
| 1671.0 | 7.822 |
| 1672.0 | 7.797 |
| 1673.0 | 7.774 |
| 1674.0 | 7.75 |
| 1675.0 | 7.721 |
| 1676.0 | 7.687 |
| 1677.0 | 7.659 |
| 1678.0 | 7.63 |
| 1679.0 | 7.605 |
| 1680.0 | 7.583 |
| 1681.0 | 7.56 |
| 1682.0 | 7.54 |
| 1683.0 | 7.518 |
| 1684.0 | 7.499 |
| 1685.0 | 7.482 |
| 1686.0 | 7.465 |
| 1687.0 | 7.445 |
| 1688.0 | 7.429 |
| 1689.0 | 7.413 |
| 1690.0 | 7.395 |
| 1691.0 | 7.376 |
| 1692.0 | 7.359 |
| 1693.0 | 7.343 |
| 1694.0 | 7.33 |
| 1695.0 | 7.314 |
| 1696.0 | 7.299 |
| 1697.0 | 7.289 |
| 1698.0 | 7.285 |
| 1699.0 | 7.272 |
| 1700.0 | 7.258 |
| 1701.0 | 7.246 |
| 1702.0 | 7.237 |
| 1703.0 | 7.244 |
| 1704.0 | 7.246 |
| 1705.0 | 7.26 |
| 1706.0 | 7.287 |
| 1707.0 | 7.307 |
| 1708.0 | 7.337 |
| 1709.0 | 7.374 |
| 1710.0 | 7.407 |
| 1711.0 | 7.444 |
| 1712.0 | 7.487 |
| 1713.0 | 7.549 |
| 1714.0 | 7.604 |
| 1715.0 | 7.635 |
| 1716.0 | 7.672 |
| 1717.0 | 7.775 |
| 1718.0 | 7.882 |
| 1719.0 | 7.916 |
| 1720.0 | 7.95 |
| 1721.0 | 8 |
| 1722.0 | 8.1 |
| 1723.0 | 8.14 |
| 1724.0 | 8.2 |
| 1725.0 | 8.3 |
| 1726.0 | 8.36 |
| 1727.0 | 8.42 |
| 1728.0 | 8.47 |
| 1729.0 | 8.52 |
| 1730.0 | 8.55 |
| 1731.0 | 8.58 |
| 1732.0 | 8.58 |
| 1733.0 | 8.58 |
| 1734.0 | 8.56 |
| 1735.0 | 8.56 |
| 1736.0 | 8.54 |
| 1737.0 | 8.52 |
| 1738.0 | 8.48 |
| 1739.0 | 8.43 |
| 1740.0 | 8.39 |
| 1741.0 | 8.33 |
| 1742.0 | 8.28 |
| 1743.0 | 8.21 |
| 1744.0 | 8.15 |
| 1745.0 | 8.09 |
| 1746.0 | 8.02 |
| 1747.0 | 7.95 |
| 1748.0 | 7.875 |
| 1749.0 | 7.802 |
| 1750.0 | 7.73 |
| 1751.0 | 7.658 |
| 1752.0 | 7.585 |
| 1753.0 | 7.512 |
| 1754.0 | 7.441 |
| 1755.0 | 7.372 |
| 1756.0 | 7.303 |
| 1757.0 | 7.235 |
| 1758.0 | 7.168 |
| 1759.0 | 7.103 |
| 1760.0 | 7.038 |
| 1761.0 | 6.974 |
| 1762.0 | 6.911 |
| 1763.0 | 6.847 |
| 1764.0 | 6.785 |
| 1765.0 | 6.724 |
| 1766.0 | 6.665 |
| 1767.0 | 6.604 |
| 1768.0 | 6.545 |
| 1769.0 | 6.487 |
| 1770.0 | 6.429 |
| 1771.0 | 6.372 |
| 1772.0 | 6.318 |
| 1773.0 | 6.263 |
| 1774.0 | 6.209 |
| 1775.0 | 6.155 |
| 1776.0 | 6.102 |
| 1777.0 | 6.051 |
| 1778.0 | 6 |
| 1779.0 | 5.95 |
| 1780.0 | 5.902 |
| 1781.0 | 5.857 |
| 1782.0 | 5.815 |
| 1783.0 | 5.778 |
| 1784.0 | 5.735 |
| 1785.0 | 5.699 |
| 1786.0 | 5.669 |
| 1787.0 | 5.641 |
| 1788.0 | 5.616 |
| 1789.0 | 5.592 |
| 1790.0 | 5.566 |
| 1791.0 | 5.539 |
| 1792.0 | 5.502 |
| 1793.0 | 5.465 |
| 1794.0 | 5.427 |
| 1795.0 | 5.392 |
| 1796.0 | 5.362 |
| 1797.0 | 5.341 |
| 1798.0 | 5.325 |
| 1799.0 | 5.328 |
| 1800.0 | 5.333 |
| 1801.0 | 5.333 |
| 1802.0 | 5.333 |
| 1803.0 | 5.345 |
| 1804.0 | 5.359 |
| 1805.0 | 5.379 |
| 1806.0 | 5.408 |
| 1807.0 | 5.443 |
| 1808.0 | 5.479 |
| 1809.0 | 5.522 |
| 1810.0 | 5.568 |
| 1811.0 | 5.617 |
| 1812.0 | 5.68 |
| 1813.0 | 5.755 |
| 1814.0 | 5.865 |
| 1815.0 | 5.997 |
| 1816.0 | 6.126 |
| 1817.0 | 6.259 |
| 1818.0 | 6.404 |
| 1819.0 | 6.547 |
| 1820.0 | 6.705 |
| 1821.0 | 6.866 |
| 1822.0 | 7.025 |
| 1823.0 | 7.167 |
| 1824.0 | 7.307 |
| 1825.0 | 7.436 |
| 1826.0 | 7.545 |
| 1827.0 | 7.634 |
| 1828.0 | 7.703 |
| 1829.0 | 7.76 |
| 1830.0 | 7.798 |
| 1831.0 | 7.825 |
| 1832.0 | 7.834 |
| 1833.0 | 7.82 |
| 1834.0 | 7.785 |
| 1835.0 | 7.742 |
| 1836.0 | 7.709 |
| 1837.0 | 7.67 |
| 1838.0 | 7.626 |
| 1839.0 | 7.581 |
| 1840.0 | 7.535 |
| 1841.0 | 7.488 |
| 1842.0 | 7.447 |
| 1843.0 | 7.404 |
| 1844.0 | 7.354 |
| 1845.0 | 7.31 |
| 1846.0 | 7.267 |
| 1847.0 | 7.222 |
| 1848.0 | 7.174 |
| 1849.0 | 7.116 |
| 1850.0 | 7.058 |
| 1851.0 | 7.005 |
| 1852.0 | 6.951 |
| 1853.0 | 6.895 |
| 1854.0 | 6.84 |
| 1855.0 | 6.784 |
| 1856.0 | 6.755 |
| 1857.0 | 6.729 |
| 1858.0 | 6.682 |
| 1859.0 | 6.629 |
| 1860.0 | 6.577 |
| 1861.0 | 6.526 |
| 1862.0 | 6.486 |
| 1863.0 | 6.444 |
| 1864.0 | 6.396 |
| 1865.0 | 6.322 |
| 1866.0 | 6.249 |
| 1867.0 | 6.181 |
| 1868.0 | 6.118 |
| 1869.0 | 6.056 |
| 1870.0 | 5.996 |
| 1871.0 | 5.937 |
| 1872.0 | 5.883 |
| 1873.0 | 5.829 |
| 1874.0 | 5.776 |
| 1875.0 | 5.726 |
| 1876.0 | 5.672 |
| 1877.0 | 5.618 |
| 1878.0 | 5.566 |
| 1879.0 | 5.517 |
| 1880.0 | 5.466 |
| 1881.0 | 5.417 |
| 1882.0 | 5.368 |
| 1883.0 | 5.322 |
| 1884.0 | 5.273 |
| 1885.0 | 5.226 |
| 1886.0 | 5.181 |
| 1887.0 | 5.136 |
| 1888.0 | 5.093 |
| 1889.0 | 5.048 |
| 1890.0 | 5.007 |
| 1891.0 | 4.967 |
| 1892.0 | 4.93 |
| 1893.0 | 4.897 |
| 1894.0 | 4.873 |
| 1895.0 | 4.866 |
| 1896.0 | 4.863 |
| 1897.0 | 4.861 |
| 1898.0 | 4.863 |
| 1899.0 | 4.869 |
| 1900.0 | 4.877 |
| 1901.0 | 4.898 |
| 1902.0 | 4.93 |
| 1903.0 | 4.965 |
| 1904.0 | 5.008 |
| 1905.0 | 5.052 |
| 1906.0 | 5.1 |
| 1907.0 | 5.151 |
| 1908.0 | 5.22 |
| 1909.0 | 5.293 |
| 1910.0 | 5.393 |
| 1911.0 | 5.502 |
| 1912.0 | 5.628 |
| 1913.0 | 5.758 |
| 1914.0 | 5.892 |
| 1915.0 | 6.028 |
| 1916.0 | 6.182 |
| 1917.0 | 6.335 |
| 1918.0 | 6.508 |
| 1919.0 | 6.662 |
| 1920.0 | 6.817 |
| 1921.0 | 6.945 |
| 1922.0 | 7.061 |
| 1923.0 | 7.155 |
| 1924.0 | 7.242 |
| 1925.0 | 7.315 |
| 1926.0 | 7.37 |
| 1927.0 | 7.418 |
| 1928.0 | 7.445 |
| 1929.0 | 7.45 |
| 1930.0 | 7.431 |
| 1931.0 | 7.405 |
| 1932.0 | 7.385 |
| 1933.0 | 7.352 |
| 1934.0 | 7.306 |
| 1935.0 | 7.259 |
| 1936.0 | 7.211 |
| 1937.0 | 7.164 |
| 1938.0 | 7.119 |
| 1939.0 | 7.073 |
| 1940.0 | 7.029 |
| 1941.0 | 6.982 |
| 1942.0 | 6.933 |
| 1943.0 | 6.886 |
| 1944.0 | 6.838 |
| 1945.0 | 6.792 |
| 1946.0 | 6.747 |
| 1947.0 | 6.7 |
| 1948.0 | 6.653 |
| 1949.0 | 6.607 |
| 1950.0 | 6.564 |
| 1951.0 | 6.521 |
| 1952.0 | 6.48 |
| 1953.0 | 6.44 |
| 1954.0 | 6.395 |
| 1955.0 | 6.355 |
| 1956.0 | 6.312 |
| 1957.0 | 6.269 |
| 1958.0 | 6.231 |
| 1959.0 | 6.189 |
| 1960.0 | 6.147 |
| 1961.0 | 6.108 |
| 1962.0 | 6.066 |
| 1963.0 | 6.028 |
| 1964.0 | 5.987 |
| 1965.0 | 5.944 |
| 1966.0 | 5.902 |
| 1967.0 | 5.862 |
| 1968.0 | 5.82 |
| 1969.0 | 5.783 |
| 1970.0 | 5.743 |
| 1971.0 | 5.707 |
| 1972.0 | 5.67 |
| 1973.0 | 5.632 |
| 1974.0 | 5.598 |
| 1975.0 | 5.561 |
| 1976.0 | 5.524 |
| 1977.0 | 5.489 |
| 1978.0 | 5.453 |
| 1979.0 | 5.418 |
| 1980.0 | 5.382 |
| 1981.0 | 5.347 |
| 1982.0 | 5.31 |
| 1983.0 | 5.276 |
| 1984.0 | 5.239 |
| 1985.0 | 5.206 |
| 1986.0 | 5.17 |
| 1987.0 | 5.139 |
| 1988.0 | 5.106 |
| 1989.0 | 5.08 |
| 1990.0 | 5.059 |
| 1991.0 | 5.054 |
| 1992.0 | 5.067 |
| 1993.0 | 5.073 |
| 1994.0 | 5.083 |
| 1995.0 | 5.094 |
| 1996.0 | 5.107 |
| 1997.0 | 5.129 |
| 1998.0 | 5.161 |
| 1999.0 | 5.197 |
| 2000.0 | 5.236 |
| 2001.0 | 5.28 |
| 2002.0 | 5.33 |
| 2003.0 | 5.383 |
| 2004.0 | 5.453 |
| 2005.0 | 5.537 |
| 2006.0 | 5.65 |
| 2007.0 | 5.788 |
| 2008.0 | 5.925 |
| 2009.0 | 6.057 |
| 2010.0 | 6.21 |
| 2011.0 | 6.375 |
| 2012.0 | 6.51 |
| 2013.0 | 6.632 |
| 2014.0 | 6.758 |
| 2015.0 | 6.866 |
| 2016.0 | 6.993 |
| 2017.0 | 7.114 |
| 2018.0 | 7.233 |
| 2019.0 | 7.367 |
| 2020.0 | 7.45 |
| 2021.0 | 7.522 |
| 2022.0 | 7.586 |
| 2023.0 | 7.652 |
| 2024.0 | 7.714 |
| 2025.0 | 7.768 |
| 2026.0 | 7.835 |
| 2027.0 | 7.892 |
| 2028.0 | 7.94 |
| 2029.0 | 7.973 |
| 2030.0 | 8 |
| 2031.0 | 8.03 |
| 2032.0 | 8.04 |
| 2033.0 | 8.04 |
| 2034.0 | 8.05 |
| 2035.0 | 8.04 |
| 2036.0 | 8.03 |
| 2037.0 | 8 |
| 2038.0 | 7.978 |
| 2039.0 | 7.948 |
| 2040.0 | 7.915 |
| 2041.0 | 7.879 |
| 2042.0 | 7.844 |
| 2043.0 | 7.804 |
| 2044.0 | 7.774 |
| 2045.0 | 7.762 |
| 2046.0 | 7.748 |
| 2047.0 | 7.739 |
| 2048.0 | 7.736 |
| 2049.0 | 7.736 |
| 2050.0 | 7.725 |
| 2051.0 | 7.709 |
| 2052.0 | 7.685 |
| 2053.0 | 7.656 |
| 2054.0 | 7.622 |
| 2055.0 | 7.58 |
| 2056.0 | 7.533 |
| 2057.0 | 7.487 |
| 2058.0 | 7.443 |
| 2059.0 | 7.413 |
| 2060.0 | 7.396 |
| 2061.0 | 7.384 |
| 2062.0 | 7.381 |
| 2063.0 | 7.382 |
| 2064.0 | 7.384 |
| 2065.0 | 7.39 |
| 2066.0 | 7.397 |
| 2067.0 | 7.407 |
| 2068.0 | 7.416 |
| 2069.0 | 7.425 |
| 2070.0 | 7.434 |
| 2071.0 | 7.444 |
| 2072.0 | 7.453 |
| 2073.0 | 7.461 |
| 2074.0 | 7.467 |
| 2075.0 | 7.471 |
| 2076.0 | 7.475 |
| 2077.0 | 7.481 |
| 2078.0 | 7.486 |
| 2079.0 | 7.491 |
| 2080.0 | 7.495 |
| 2081.0 | 7.499 |
| 2082.0 | 7.503 |
| 2083.0 | 7.506 |
| 2084.0 | 7.512 |
| 2085.0 | 7.52 |
| 2086.0 | 7.524 |
| 2087.0 | 7.542 |
| 2088.0 | 7.568 |
| 2089.0 | 7.564 |
| 2090.0 | 7.591 |
| 2091.0 | 7.618 |
| 2092.0 | 7.637 |
| 2093.0 | 7.647 |
| 2094.0 | 7.667 |
| 2095.0 | 7.691 |
| 2096.0 | 7.718 |
| 2097.0 | 7.741 |
| 2098.0 | 7.762 |
| 2099.0 | 7.782 |
| 2100.0 | 7.817 |
| 2101.0 | 7.861 |
| 2102.0 | 7.933 |
| 2103.0 | 8.03 |
| 2104.0 | 8.12 |
| 2105.0 | 8.22 |
| 2106.0 | 8.34 |
| 2107.0 | 8.45 |
| 2108.0 | 8.57 |
| 2109.0 | 8.7 |
| 2110.0 | 8.82 |
| 2111.0 | 8.95 |
| 2112.0 | 9.07 |
| 2113.0 | 9.19 |
| 2114.0 | 9.29 |
| 2115.0 | 9.37 |
| 2116.0 | 9.44 |
| 2117.0 | 9.49 |
| 2118.0 | 9.52 |
| 2119.0 | 9.56 |
| 2120.0 | 9.58 |
| 2121.0 | 9.57 |
| 2122.0 | 9.52 |
| 2123.0 | 9.47 |
| 2124.0 | 9.44 |
| 2125.0 | 9.4 |
| 2126.0 | 9.36 |
| 2127.0 | 9.31 |
| 2128.0 | 9.26 |
| 2129.0 | 9.22 |
| 2130.0 | 9.16 |
| 2131.0 | 9.1 |
| 2132.0 | 9.04 |
| 2133.0 | 8.99 |
| 2134.0 | 8.94 |
| 2135.0 | 8.89 |
| 2136.0 | 8.86 |
| 2137.0 | 8.81 |
| 2138.0 | 8.76 |
| 2139.0 | 8.72 |
| 2140.0 | 8.68 |
| 2141.0 | 8.64 |
| 2142.0 | 8.6 |
| 2143.0 | 8.56 |
| 2144.0 | 8.53 |
| 2145.0 | 8.49 |
| 2146.0 | 8.43 |
| 2147.0 | 8.37 |
| 2148.0 | 8.33 |
| 2149.0 | 8.29 |
| 2150.0 | 8.25 |
| 2151.0 | 8.21 |
| 2152.0 | 8.18 |
| 2153.0 | 8.14 |
| 2154.0 | 8.1 |
| 2155.0 | 8.05 |
| 2156.0 | 7.999 |
| 2157.0 | 7.95 |
| 2158.0 | 7.904 |
| 2159.0 | 7.858 |
| 2160.0 | 7.815 |
| 2161.0 | 7.774 |
| 2162.0 | 7.732 |
| 2163.0 | 7.692 |
| 2164.0 | 7.652 |
| 2165.0 | 7.613 |
| 2166.0 | 7.575 |
| 2167.0 | 7.538 |
| 2168.0 | 7.501 |
| 2169.0 | 7.468 |
| 2170.0 | 7.432 |
| 2171.0 | 7.398 |
| 2172.0 | 7.368 |
| 2173.0 | 7.34 |
| 2174.0 | 7.31 |
| 2175.0 | 7.277 |
| 2176.0 | 7.241 |
| 2177.0 | 7.206 |
| 2178.0 | 7.17 |
| 2179.0 | 7.135 |
| 2180.0 | 7.104 |
| 2181.0 | 7.08 |
| 2182.0 | 7.064 |
| 2183.0 | 7.05 |
| 2184.0 | 7.056 |
| 2185.0 | 7.062 |
| 2186.0 | 7.072 |
| 2187.0 | 7.09 |
| 2188.0 | 7.106 |
| 2189.0 | 7.124 |
| 2190.0 | 7.152 |
| 2191.0 | 7.181 |
| 2192.0 | 7.214 |
| 2193.0 | 7.251 |
| 2194.0 | 7.29 |
| 2195.0 | 7.328 |
| 2196.0 | 7.378 |
| 2197.0 | 7.449 |
| 2198.0 | 7.537 |
| 2199.0 | 7.648 |
| 2200.0 | 7.763 |
| 2201.0 | 7.888 |
| 2202.0 | 8.01 |
| 2203.0 | 8.14 |
| 2204.0 | 8.28 |
| 2205.0 | 8.41 |
| 2206.0 | 8.54 |
| 2207.0 | 8.68 |
| 2208.0 | 8.82 |
| 2209.0 | 8.94 |
| 2210.0 | 9.05 |
| 2211.0 | 9.14 |
| 2212.0 | 9.22 |
| 2213.0 | 9.28 |
| 2214.0 | 9.32 |
| 2215.0 | 9.36 |
| 2216.0 | 9.38 |
| 2217.0 | 9.37 |
| 2218.0 | 9.33 |
| 2219.0 | 9.29 |
| 2220.0 | 9.25 |
| 2221.0 | 9.21 |
| 2222.0 | 9.16 |
| 2223.0 | 9.1 |
| 2224.0 | 9.05 |
| 2225.0 | 9 |
| 2226.0 | 8.95 |
| 2227.0 | 8.91 |
| 2228.0 | 8.86 |
| 2229.0 | 8.82 |
| 2230.0 | 8.78 |
| 2231.0 | 8.74 |
| 2232.0 | 8.7 |
| 2233.0 | 8.66 |
| 2234.0 | 8.62 |
| 2235.0 | 8.58 |
| 2236.0 | 8.55 |
| 2237.0 | 8.52 |
| 2238.0 | 8.47 |
| 2239.0 | 8.42 |
| 2240.0 | 8.38 |
| 2241.0 | 8.34 |
| 2242.0 | 8.3 |
| 2243.0 | 8.27 |
| 2244.0 | 8.23 |
| 2245.0 | 8.19 |
| 2246.0 | 8.15 |
| 2247.0 | 8.1 |
| 2248.0 | 8.06 |
| 2249.0 | 8.01 |
| 2250.0 | 7.974 |
| 2251.0 | 7.935 |
| 2252.0 | 7.895 |
| 2253.0 | 7.855 |
| 2254.0 | 7.816 |
| 2255.0 | 7.775 |
| 2256.0 | 7.735 |
| 2257.0 | 7.695 |
| 2258.0 | 7.654 |
| 2259.0 | 7.614 |
| 2260.0 | 7.575 |
| 2261.0 | 7.536 |
| 2262.0 | 7.499 |
| 2263.0 | 7.462 |
| 2264.0 | 7.423 |
| 2265.0 | 7.385 |
| 2266.0 | 7.346 |
| 2267.0 | 7.309 |
| 2268.0 | 7.272 |
| 2269.0 | 7.233 |
| 2270.0 | 7.196 |
| 2271.0 | 7.159 |
| 2272.0 | 7.119 |
| 2273.0 | 7.085 |
| 2274.0 | 7.045 |
| 2275.0 | 7.009 |
| 2276.0 | 6.977 |
| 2277.0 | 6.948 |
| 2278.0 | 6.919 |
| 2279.0 | 6.896 |
| 2280.0 | 6.895 |
| 2281.0 | 6.911 |
| 2282.0 | 6.915 |
| 2283.0 | 6.919 |
| 2284.0 | 6.926 |
| 2285.0 | 6.935 |
| 2286.0 | 6.951 |
| 2287.0 | 6.976 |
| 2288.0 | 7.004 |
| 2289.0 | 7.035 |
| 2290.0 | 7.07 |
| 2291.0 | 7.107 |
| 2292.0 | 7.162 |
| 2293.0 | 7.231 |
| 2294.0 | 7.324 |
| 2295.0 | 7.425 |
| 2296.0 | 7.54 |
| 2297.0 | 7.665 |
| 2298.0 | 7.789 |
| 2299.0 | 7.915 |
| 2300.0 | 8.05 |
| 2301.0 | 8.19 |
| 2302.0 | 8.34 |
| 2303.0 | 8.49 |
| 2304.0 | 8.63 |
| 2305.0 | 8.76 |
| 2306.0 | 8.88 |
| 2307.0 | 8.98 |
| 2308.0 | 9.05 |
| 2309.0 | 9.1 |
| 2310.0 | 9.14 |
| 2311.0 | 9.18 |
| 2312.0 | 9.19 |
| 2313.0 | 9.17 |
| 2314.0 | 9.13 |
| 2315.0 | 9.09 |
| 2316.0 | 9.06 |
| 2317.0 | 9.01 |
| 2318.0 | 8.95 |
| 2319.0 | 8.9 |
| 2320.0 | 8.84 |
| 2321.0 | 8.79 |
| 2322.0 | 8.73 |
| 2323.0 | 8.68 |
| 2324.0 | 8.63 |
| 2325.0 | 8.58 |
| 2326.0 | 8.53 |
| 2327.0 | 8.48 |
| 2328.0 | 8.43 |
| 2329.0 | 8.38 |
| 2330.0 | 8.33 |
| 2331.0 | 8.28 |
| 2332.0 | 8.24 |
| 2333.0 | 8.19 |
| 2334.0 | 8.14 |
| 2335.0 | 8.09 |
| 2336.0 | 8.04 |
| 2337.0 | 7.992 |
| 2338.0 | 7.939 |
| 2339.0 | 7.891 |
| 2340.0 | 7.841 |
| 2341.0 | 7.789 |
| 2342.0 | 7.739 |
| 2343.0 | 7.691 |
| 2344.0 | 7.642 |
| 2345.0 | 7.595 |
| 2346.0 | 7.549 |
| 2347.0 | 7.505 |
| 2348.0 | 7.46 |
| 2349.0 | 7.413 |
| 2350.0 | 7.367 |
| 2351.0 | 7.324 |
| 2352.0 | 7.279 |
| 2353.0 | 7.234 |
| 2354.0 | 7.19 |
| 2355.0 | 7.144 |
| 2356.0 | 7.098 |
| 2357.0 | 7.053 |
| 2358.0 | 7.009 |
| 2359.0 | 6.964 |
| 2360.0 | 6.92 |
| 2361.0 | 6.875 |
| 2362.0 | 6.832 |
| 2363.0 | 6.788 |
| 2364.0 | 6.745 |
| 2365.0 | 6.699 |
| 2366.0 | 6.656 |
| 2367.0 | 6.613 |
| 2368.0 | 6.569 |
| 2369.0 | 6.526 |
| 2370.0 | 6.483 |
| 2371.0 | 6.444 |
| 2372.0 | 6.404 |
| 2373.0 | 6.37 |
| 2374.0 | 6.339 |
| 2375.0 | 6.311 |
| 2376.0 | 6.298 |
| 2377.0 | 6.313 |
| 2378.0 | 6.32 |
| 2379.0 | 6.323 |
| 2380.0 | 6.327 |
| 2381.0 | 6.342 |
| 2382.0 | 6.36 |
| 2383.0 | 6.388 |
| 2384.0 | 6.419 |
| 2385.0 | 6.453 |
| 2386.0 | 6.491 |
| 2387.0 | 6.533 |
| 2388.0 | 6.588 |
| 2389.0 | 6.655 |
| 2390.0 | 6.748 |
| 2391.0 | 6.861 |
| 2392.0 | 6.983 |
| 2393.0 | 7.116 |
| 2394.0 | 7.239 |
| 2395.0 | 7.352 |
| 2396.0 | 7.483 |
| 2397.0 | 7.624 |
| 2398.0 | 7.765 |
| 2399.0 | 7.906 |
| 2400.0 | 8.04 |
| 2401.0 | 8.17 |
| 2402.0 | 8.27 |
| 2403.0 | 8.37 |
| 2404.0 | 8.45 |
| 2405.0 | 8.51 |
| 2406.0 | 8.57 |
| 2407.0 | 8.62 |
| 2408.0 | 8.65 |
| 2409.0 | 8.66 |
| 2410.0 | 8.66 |
| 2411.0 | 8.65 |
| 2412.0 | 8.64 |
| 2413.0 | 8.62 |
| 2414.0 | 8.59 |
| 2415.0 | 8.56 |
| 2416.0 | 8.52 |
| 2417.0 | 8.48 |
| 2418.0 | 8.44 |
| 2419.0 | 8.4 |
| 2420.0 | 8.37 |
| 2421.0 | 8.34 |
| 2422.0 | 8.3 |
| 2423.0 | 8.26 |
| 2424.0 | 8.23 |
| 2425.0 | 8.19 |
| 2426.0 | 8.16 |
| 2427.0 | 8.13 |
| 2428.0 | 8.1 |
| 2429.0 | 8.07 |
| 2430.0 | 8.04 |
| 2431.0 | 8.02 |
| 2432.0 | 7.989 |
| 2433.0 | 7.959 |
| 2434.0 | 7.925 |
| 2435.0 | 7.892 |
| 2436.0 | 7.86 |
| 2437.0 | 7.827 |
| 2438.0 | 7.797 |
| 2439.0 | 7.766 |
| 2440.0 | 7.739 |
| 2441.0 | 7.711 |
| 2442.0 | 7.681 |
| 2443.0 | 7.646 |
| 2444.0 | 7.613 |
| 2445.0 | 7.577 |
| 2446.0 | 7.542 |
| 2447.0 | 7.509 |
| 2448.0 | 7.467 |
| 2449.0 | 7.426 |
| 2450.0 | 7.386 |
| 2451.0 | 7.348 |
| 2452.0 | 7.309 |
| 2453.0 | 7.269 |
| 2454.0 | 7.23 |
| 2455.0 | 7.188 |
| 2456.0 | 7.149 |
| 2457.0 | 7.111 |
| 2458.0 | 7.082 |
| 2459.0 | 7.059 |
| 2460.0 | 7.04 |
| 2461.0 | 7.02 |
| 2462.0 | 7.003 |
| 2463.0 | 6.982 |
| 2464.0 | 6.953 |
| 2465.0 | 6.922 |
| 2466.0 | 6.888 |
| 2467.0 | 6.851 |
| 2468.0 | 6.815 |
| 2469.0 | 6.781 |
| 2470.0 | 6.752 |
| 2471.0 | 6.727 |
| 2472.0 | 6.709 |
| 2473.0 | 6.723 |
| 2474.0 | 6.732 |
| 2475.0 | 6.735 |
| 2476.0 | 6.741 |
| 2477.0 | 6.752 |
| 2478.0 | 6.766 |
| 2479.0 | 6.79 |
| 2480.0 | 6.819 |
| 2481.0 | 6.85 |
| 2482.0 | 6.886 |
| 2483.0 | 6.924 |
| 2484.0 | 6.977 |
| 2485.0 | 7.049 |
| 2486.0 | 7.134 |
| 2487.0 | 7.231 |
| 2488.0 | 7.336 |
| 2489.0 | 7.459 |
| 2490.0 | 7.586 |
| 2491.0 | 7.708 |
| 2492.0 | 7.838 |
| 2493.0 | 7.972 |
| 2494.0 | 8.11 |
| 2495.0 | 8.23 |
| 2496.0 | 8.35 |
| 2497.0 | 8.47 |
| 2498.0 | 8.57 |
| 2499.0 | 8.66 |
| 2500.0 | 8.72 |
| 2501.0 | 8.76 |
| 2502.0 | 8.78 |
| 2503.0 | 8.81 |
| 2504.0 | 8.83 |
| 2505.0 | 8.83 |
| 2506.0 | 8.8 |
| 2507.0 | 8.78 |
| 2508.0 | 8.74 |
| 2509.0 | 8.7 |
| 2510.0 | 8.65 |
| 2511.0 | 8.6 |
| 2512.0 | 8.56 |
| 2513.0 | 8.51 |
| 2514.0 | 8.47 |
| 2515.0 | 8.42 |
| 2516.0 | 8.38 |
| 2517.0 | 8.34 |
| 2518.0 | 8.31 |
| 2519.0 | 8.27 |
| 2520.0 | 8.23 |
| 2521.0 | 8.19 |
| 2522.0 | 8.15 |
| 2523.0 | 8.11 |
| 2524.0 | 8.08 |
| 2525.0 | 8.04 |
| 2526.0 | 8.01 |
| 2527.0 | 7.969 |
| 2528.0 | 7.932 |
| 2529.0 | 7.891 |
| 2530.0 | 7.846 |
| 2531.0 | 7.8 |
| 2532.0 | 7.758 |
| 2533.0 | 7.715 |
| 2534.0 | 7.672 |
| 2535.0 | 7.632 |
| 2536.0 | 7.59 |
| 2537.0 | 7.548 |
| 2538.0 | 7.5 |
| 2539.0 | 7.457 |
| 2540.0 | 7.419 |
| 2541.0 | 7.379 |
| 2542.0 | 7.336 |
| 2543.0 | 7.296 |
| 2544.0 | 7.255 |
| 2545.0 | 7.213 |
| 2546.0 | 7.171 |
| 2547.0 | 7.132 |
| 2548.0 | 7.09 |
| 2549.0 | 7.049 |
| 2550.0 | 7.006 |
| 2551.0 | 6.96 |
| 2552.0 | 6.917 |
| 2553.0 | 6.875 |
| 2554.0 | 6.835 |
| 2555.0 | 6.793 |
| 2556.0 | 6.751 |
| 2557.0 | 6.713 |
| 2558.0 | 6.673 |
| 2559.0 | 6.631 |
| 2560.0 | 6.589 |
| 2561.0 | 6.548 |
| 2562.0 | 6.508 |
| 2563.0 | 6.469 |
| 2564.0 | 6.433 |
| 2565.0 | 6.4 |
| 2566.0 | 6.372 |
| 2567.0 | 6.349 |
| 2568.0 | 6.334 |
| 2569.0 | 6.345 |
| 2570.0 | 6.358 |
| 2571.0 | 6.364 |
| 2572.0 | 6.375 |
| 2573.0 | 6.389 |
| 2574.0 | 6.409 |
| 2575.0 | 6.437 |
| 2576.0 | 6.469 |
| 2577.0 | 6.506 |
| 2578.0 | 6.545 |
| 2579.0 | 6.583 |
| 2580.0 | 6.635 |
| 2581.0 | 6.706 |
| 2582.0 | 6.791 |
| 2583.0 | 6.893 |
| 2584.0 | 6.997 |
| 2585.0 | 7.118 |
| 2586.0 | 7.251 |
| 2587.0 | 7.385 |
| 2588.0 | 7.521 |
| 2589.0 | 7.657 |
| 2590.0 | 7.793 |
| 2591.0 | 7.916 |
| 2592.0 | 8.04 |
| 2593.0 | 8.16 |
| 2594.0 | 8.26 |
| 2595.0 | 8.31 |
| 2596.0 | 8.36 |
| 2597.0 | 8.42 |
| 2598.0 | 8.46 |
| 2599.0 | 8.49 |
| 2600.0 | 8.51 |
| 2601.0 | 8.51 |
| 2602.0 | 8.51 |
| 2603.0 | 8.48 |
| 2604.0 | 8.46 |
| 2605.0 | 8.44 |
| 2606.0 | 8.41 |
| 2607.0 | 8.38 |
| 2608.0 | 8.35 |
| 2609.0 | 8.32 |
| 2610.0 | 8.29 |
| 2611.0 | 8.25 |
| 2612.0 | 8.22 |
| 2613.0 | 8.18 |
| 2614.0 | 8.14 |
| 2615.0 | 8.1 |
| 2616.0 | 8.08 |
| 2617.0 | 8.06 |
| 2618.0 | 8.04 |
| 2619.0 | 8.01 |
| 2620.0 | 7.981 |
| 2621.0 | 7.947 |
| 2622.0 | 7.909 |
| 2623.0 | 7.877 |
| 2624.0 | 7.839 |
| 2625.0 | 7.804 |
| 2626.0 | 7.771 |
| 2627.0 | 7.736 |
| 2628.0 | 7.681 |
| 2629.0 | 7.63 |
| 2630.0 | 7.575 |
| 2631.0 | 7.519 |
| 2632.0 | 7.463 |
| 2633.0 | 7.412 |
| 2634.0 | 7.362 |
| 2635.0 | 7.319 |
| 2636.0 | 7.265 |
| 2637.0 | 7.211 |
| 2638.0 | 7.16 |
| 2639.0 | 7.117 |
| 2640.0 | 7.073 |
| 2641.0 | 7.031 |
| 2642.0 | 6.993 |
| 2643.0 | 6.959 |
| 2644.0 | 6.925 |
| 2645.0 | 6.894 |
| 2646.0 | 6.86 |
| 2647.0 | 6.819 |
| 2648.0 | 6.779 |
| 2649.0 | 6.741 |
| 2650.0 | 6.705 |
| 2651.0 | 6.662 |
| 2652.0 | 6.611 |
| 2653.0 | 6.567 |
| 2654.0 | 6.53 |
| 2655.0 | 6.508 |
| 2656.0 | 6.487 |
| 2657.0 | 6.463 |
| 2658.0 | 6.437 |
| 2659.0 | 6.406 |
| 2660.0 | 6.383 |
| 2661.0 | 6.366 |
| 2662.0 | 6.364 |
| 2663.0 | 6.373 |
| 2664.0 | 6.388 |
| 2665.0 | 6.41 |
| 2666.0 | 6.441 |
| 2667.0 | 6.484 |
| 2668.0 | 6.523 |
| 2669.0 | 6.566 |
| 2670.0 | 6.597 |
| 2671.0 | 6.638 |
| 2672.0 | 6.676 |
| 2673.0 | 6.736 |
| 2674.0 | 6.787 |
| 2675.0 | 6.864 |
| 2676.0 | 6.941 |
| 2677.0 | 7.023 |
| 2678.0 | 7.153 |
| 2679.0 | 7.222 |
| 2680.0 | 7.323 |
| 2681.0 | 7.434 |
| 2682.0 | 7.524 |
| 2683.0 | 7.595 |
| 2684.0 | 7.68 |
| 2685.0 | 7.765 |
| 2686.0 | 7.834 |
| 2687.0 | 7.903 |
| 2688.0 | 7.994 |
| 2689.0 | 8.08 |
| 2690.0 | 8.18 |
| 2691.0 | 8.27 |
| 2692.0 | 8.3 |
| 2693.0 | 8.37 |
| 2694.0 | 8.45 |
| 2695.0 | 8.51 |
| 2696.0 | 8.55 |
| 2697.0 | 8.58 |
| 2698.0 | 8.62 |
| 2699.0 | 8.63 |
| 2700.0 | 8.62 |
| 2701.0 | 8.57 |
| 2702.0 | 8.52 |
| 2703.0 | 8.45 |
| 2704.0 | 8.39 |
| 2705.0 | 8.34 |
| 2706.0 | 8.27 |
| 2707.0 | 8.21 |
| 2708.0 | 8.15 |
| 2709.0 | 8.07 |
| 2710.0 | 8 |
| 2711.0 | 7.931 |
| 2712.0 | 7.877 |
| 2713.0 | 7.829 |
| 2714.0 | 7.777 |
| 2715.0 | 7.737 |
| 2716.0 | 7.713 |
| 2717.0 | 7.688 |
| 2718.0 | 7.668 |
| 2719.0 | 7.651 |
| 2720.0 | 7.635 |
| 2721.0 | 7.609 |
| 2722.0 | 7.588 |
| 2723.0 | 7.563 |
| 2724.0 | 7.536 |
| 2725.0 | 7.504 |
| 2726.0 | 7.475 |
| 2727.0 | 7.433 |
| 2728.0 | 7.408 |
| 2729.0 | 7.384 |
| 2730.0 | 7.354 |
| 2731.0 | 7.331 |
| 2732.0 | 7.309 |
| 2733.0 | 7.278 |
| 2734.0 | 7.253 |
| 2735.0 | 7.227 |
| 2736.0 | 7.208 |
| 2737.0 | 7.19 |
| 2738.0 | 7.17 |
| 2739.0 | 7.151 |
| 2740.0 | 7.135 |
| 2741.0 | 7.121 |
| 2742.0 | 7.11 |
| 2743.0 | 7.099 |
| 2744.0 | 7.087 |
| 2745.0 | 7.071 |
| 2746.0 | 7.055 |
| 2747.0 | 7.037 |
| 2748.0 | 7.017 |
| 2749.0 | 6.998 |
| 2750.0 | 6.976 |
| 2751.0 | 6.948 |
| 2752.0 | 6.927 |
| 2753.0 | 6.908 |
| 2754.0 | 6.893 |
| 2755.0 | 6.878 |
| 2756.0 | 6.867 |
| 2757.0 | 6.855 |
| 2758.0 | 6.845 |
| 2759.0 | 6.844 |
| 2760.0 | 6.845 |
| 2761.0 | 6.849 |
| 2762.0 | 6.86 |
| 2763.0 | 6.875 |
| 2764.0 | 6.897 |
| 2765.0 | 6.927 |
| 2766.0 | 6.947 |
| 2767.0 | 6.976 |
| 2768.0 | 7.008 |
| 2769.0 | 7.039 |
| 2770.0 | 7.079 |
| 2771.0 | 7.096 |
| 2772.0 | 7.159 |
| 2773.0 | 7.193 |
| 2774.0 | 7.231 |
| 2775.0 | 7.267 |
| 2776.0 | 7.294 |
| 2777.0 | 7.32 |
| 2778.0 | 7.333 |
| 2779.0 | 7.37 |
| 2780.0 | 7.419 |
| 2781.0 | 7.446 |
| 2782.0 | 7.516 |
| 2783.0 | 7.568 |
| 2784.0 | 7.604 |
| 2785.0 | 7.667 |
| 2786.0 | 7.673 |
| 2787.0 | 7.681 |
| 2788.0 | 7.696 |
| 2789.0 | 7.694 |
| 2790.0 | 7.718 |
| 2791.0 | 7.727 |
| 2792.0 | 7.743 |
| 2793.0 | 7.751 |
| 2794.0 | 7.735 |
| 2795.0 | 7.705 |
| 2796.0 | 7.669 |
| 2797.0 | 7.631 |
| 2798.0 | 7.589 |
| 2799.0 | 7.544 |
| 2800.0 | 7.497 |
| 2801.0 | 7.446 |
| 2802.0 | 7.386 |
| 2803.0 | 7.315 |
| 2804.0 | 7.248 |
| 2805.0 | 7.18 |
| 2806.0 | 7.111 |
| 2807.0 | 7.05 |
| 2808.0 | 6.998 |
| 2809.0 | 6.936 |
| 2810.0 | 6.873 |
| 2811.0 | 6.812 |
| 2812.0 | 6.75 |
| 2813.0 | 6.686 |
| 2814.0 | 6.622 |
| 2815.0 | 6.555 |
| 2816.0 | 6.49 |
| 2817.0 | 6.427 |
| 2818.0 | 6.365 |
| 2819.0 | 6.308 |
| 2820.0 | 6.249 |
| 2821.0 | 6.189 |
| 2822.0 | 6.131 |
| 2823.0 | 6.074 |
| 2824.0 | 6.032 |
| 2825.0 | 6 |
| 2826.0 | 5.975 |
| 2827.0 | 5.956 |
| 2828.0 | 5.939 |
| 2829.0 | 5.929 |
| 2830.0 | 5.911 |
| 2831.0 | 5.875 |
| 2832.0 | 5.836 |
| 2833.0 | 5.796 |
| 2834.0 | 5.747 |
| 2835.0 | 5.695 |
| 2836.0 | 5.641 |
| 2837.0 | 5.589 |
| 2838.0 | 5.536 |
| 2839.0 | 5.487 |
| 2840.0 | 5.44 |
| 2841.0 | 5.397 |
| 2842.0 | 5.351 |
| 2843.0 | 5.307 |
| 2844.0 | 5.264 |
| 2845.0 | 5.22 |
| 2846.0 | 5.175 |
| 2847.0 | 5.13 |
| 2848.0 | 5.087 |
| 2849.0 | 5.047 |
| 2850.0 | 5.011 |
| 2851.0 | 4.994 |
| 2852.0 | 4.978 |
| 2853.0 | 4.971 |
| 2854.0 | 4.98 |
| 2855.0 | 4.992 |
| 2856.0 | 5.016 |
| 2857.0 | 5.05 |
| 2858.0 | 5.096 |
| 2859.0 | 5.137 |
| 2860.0 | 5.195 |
| 2861.0 | 5.245 |
| 2862.0 | 5.298 |
| 2863.0 | 5.339 |
| 2864.0 | 5.389 |
| 2865.0 | 5.466 |
| 2866.0 | 5.526 |
| 2867.0 | 5.578 |
| 2868.0 | 5.632 |
| 2869.0 | 5.702 |
| 2870.0 | 5.779 |
| 2871.0 | 5.859 |
| 2872.0 | 5.94 |
| 2873.0 | 6.05 |
| 2874.0 | 6.16 |
| 2875.0 | 6.271 |
| 2876.0 | 6.389 |
| 2877.0 | 6.507 |
| 2878.0 | 6.627 |
| 2879.0 | 6.743 |
| 2880.0 | 6.865 |
| 2881.0 | 6.982 |
| 2882.0 | 7.083 |
| 2883.0 | 7.181 |
| 2884.0 | 7.281 |
| 2885.0 | 7.33 |
| 2886.0 | 7.368 |
| 2887.0 | 7.41 |
| 2888.0 | 7.44 |
| 2889.0 | 7.442 |
| 2890.0 | 7.43 |
| 2891.0 | 7.413 |
| 2892.0 | 7.391 |
| 2893.0 | 7.36 |
| 2894.0 | 7.323 |
| 2895.0 | 7.283 |
| 2896.0 | 7.245 |
| 2897.0 | 7.212 |
| 2898.0 | 7.182 |
| 2899.0 | 7.154 |
| 2900.0 | 7.127 |
| 2901.0 | 7.097 |
| 2902.0 | 7.065 |
| 2903.0 | 7.031 |
| 2904.0 | 7 |
| 2905.0 | 6.968 |
| 2906.0 | 6.933 |
| 2907.0 | 6.896 |
| 2908.0 | 6.859 |
| 2909.0 | 6.822 |
| 2910.0 | 6.782 |
| 2911.0 | 6.738 |
| 2912.0 | 6.693 |
| 2913.0 | 6.65 |
| 2914.0 | 6.606 |
| 2915.0 | 6.563 |
| 2916.0 | 6.523 |
| 2917.0 | 6.481 |
| 2918.0 | 6.44 |
| 2919.0 | 6.401 |
| 2920.0 | 6.36 |
| 2921.0 | 6.331 |
| 2922.0 | 6.306 |
| 2923.0 | 6.273 |
| 2924.0 | 6.249 |
| 2925.0 | 6.232 |
| 2926.0 | 6.218 |
| 2927.0 | 6.201 |
| 2928.0 | 6.181 |
| 2929.0 | 6.161 |
| 2930.0 | 6.139 |
| 2931.0 | 6.111 |
| 2932.0 | 6.081 |
| 2933.0 | 6.051 |
| 2934.0 | 6.017 |
| 2935.0 | 5.979 |
| 2936.0 | 5.948 |
| 2937.0 | 5.919 |
| 2938.0 | 5.89 |
| 2939.0 | 5.863 |
| 2940.0 | 5.84 |
| 2941.0 | 5.818 |
| 2942.0 | 5.796 |
| 2943.0 | 5.77 |
| 2944.0 | 5.746 |
| 2945.0 | 5.72 |
| 2946.0 | 5.692 |
| 2947.0 | 5.66 |
| 2948.0 | 5.627 |
| 2949.0 | 5.606 |
| 2950.0 | 5.596 |
| 2951.0 | 5.591 |
| 2952.0 | 5.594 |
| 2953.0 | 5.603 |
| 2954.0 | 5.622 |
| 2955.0 | 5.638 |
| 2956.0 | 5.654 |
| 2957.0 | 5.683 |
| 2958.0 | 5.719 |
| 2959.0 | 5.761 |
| 2960.0 | 5.794 |
| 2961.0 | 5.855 |
| 2962.0 | 5.927 |
| 2963.0 | 6.003 |
| 2964.0 | 6.097 |
| 2965.0 | 6.197 |
| 2966.0 | 6.296 |
| 2967.0 | 6.406 |
| 2968.0 | 6.506 |
| 2969.0 | 6.617 |
| 2970.0 | 6.734 |
| 2971.0 | 6.849 |
| 2972.0 | 6.977 |
| 2973.0 | 7.097 |
| 2974.0 | 7.216 |
| 2975.0 | 7.33 |
| 2976.0 | 7.437 |
| 2977.0 | 7.531 |
| 2978.0 | 7.627 |
| 2979.0 | 7.709 |
| 2980.0 | 7.785 |
| 2981.0 | 7.838 |
| 2982.0 | 7.887 |
| 2983.0 | 7.949 |
| 2984.0 | 7.989 |
| 2985.0 | 8.01 |
| 2986.0 | 8.02 |
| 2987.0 | 8.01 |
| 2988.0 | 8.02 |
| 2989.0 | 8.02 |
| 2990.0 | 7.995 |
| 2991.0 | 7.965 |
| 2992.0 | 7.931 |
| 2993.0 | 7.897 |
| 2994.0 | 7.857 |
| 2995.0 | 7.814 |
| 2996.0 | 7.77 |
| 2997.0 | 7.727 |
| 2998.0 | 7.685 |
| 2999.0 | 7.647 |
| 3000.0 | 7.611 |
| 3001.0 | 7.585 |
| 3002.0 | 7.552 |
| 3003.0 | 7.515 |
| 3004.0 | 7.487 |
| 3005.0 | 7.46 |
| 3006.0 | 7.42 |
| 3007.0 | 7.376 |
| 3008.0 | 7.33 |
| 3009.0 | 7.282 |
| 3010.0 | 7.234 |
| 3011.0 | 7.186 |
| 3012.0 | 7.138 |
| 3013.0 | 7.091 |
| 3014.0 | 7.048 |
| 3015.0 | 7.005 |
| 3016.0 | 6.965 |
| 3017.0 | 6.931 |
| 3018.0 | 6.899 |
| 3019.0 | 6.871 |
| 3020.0 | 6.85 |
| 3021.0 | 6.835 |
| 3022.0 | 6.821 |
| 3023.0 | 6.81 |
| 3024.0 | 6.807 |
| 3025.0 | 6.808 |
| 3026.0 | 6.809 |
| 3027.0 | 6.817 |
| 3028.0 | 6.83 |
| 3029.0 | 6.84 |
| 3030.0 | 6.852 |
| 3031.0 | 6.856 |
| 3032.0 | 6.864 |
| 3033.0 | 6.878 |
| 3034.0 | 6.886 |
| 3035.0 | 6.887 |
| 3036.0 | 6.89 |
| 3037.0 | 6.892 |
| 3038.0 | 6.879 |
| 3039.0 | 6.861 |
| 3040.0 | 6.84 |
| 3041.0 | 6.821 |
| 3042.0 | 6.8 |
| 3043.0 | 6.78 |
| 3044.0 | 6.763 |
| 3045.0 | 6.753 |
| 3046.0 | 6.75 |
| 3047.0 | 6.754 |
| 3048.0 | 6.767 |
| 3049.0 | 6.785 |
| 3050.0 | 6.812 |
| 3051.0 | 6.85 |
| 3052.0 | 6.897 |
| 3053.0 | 6.928 |
| 3054.0 | 6.984 |
| 3055.0 | 7.07 |
| 3056.0 | 7.135 |
| 3057.0 | 7.203 |
| 3058.0 | 7.277 |
| 3059.0 | 7.379 |
| 3060.0 | 7.459 |
| 3061.0 | 7.543 |
| 3062.0 | 7.617 |
| 3063.0 | 7.631 |
| 3064.0 | 7.644 |
| 3065.0 | 7.676 |
| 3066.0 | 7.723 |
| 3067.0 | 7.782 |
| 3068.0 | 7.875 |
| 3069.0 | 7.894 |
| 3070.0 | 7.918 |
| 3071.0 | 7.977 |
| 3072.0 | 8.02 |
| 3073.0 | 8.04 |
| 3074.0 | 8.05 |
| 3075.0 | 8.04 |
| 3076.0 | 8.05 |
| 3077.0 | 8.06 |
| 3078.0 | 8.07 |
| 3079.0 | 8.09 |
| 3080.0 | 8.06 |
| 3081.0 | 8.03 |
| 3082.0 | 8 |
| 3083.0 | 7.987 |
| 3084.0 | 7.966 |
| 3085.0 | 7.937 |
| 3086.0 | 7.893 |
| 3087.0 | 7.851 |
| 3088.0 | 7.804 |
| 3089.0 | 7.765 |
| 3090.0 | 7.727 |
| 3091.0 | 7.683 |
| 3092.0 | 7.64 |
| 3093.0 | 7.595 |
| 3094.0 | 7.535 |
| 3095.0 | 7.471 |
| 3096.0 | 7.414 |
| 3097.0 | 7.363 |
| 3098.0 | 7.329 |
| 3099.0 | 7.282 |
| 3100.0 | 7.228 |
| 3101.0 | 7.176 |
| 3102.0 | 7.143 |
| 3103.0 | 7.108 |
| 3104.0 | 7.062 |
| 3105.0 | 7.013 |
| 3106.0 | 6.965 |
| 3107.0 | 6.927 |
| 3108.0 | 6.893 |
| 3109.0 | 6.857 |
| 3110.0 | 6.8 |
| 3111.0 | 6.739 |
| 3112.0 | 6.68 |
| 3113.0 | 6.614 |
| 3114.0 | 6.546 |
| 3115.0 | 6.475 |
| 3116.0 | 6.409 |
| 3117.0 | 6.341 |
| 3118.0 | 6.274 |
| 3119.0 | 6.209 |
| 3120.0 | 6.149 |
| 3121.0 | 6.087 |
| 3122.0 | 6.031 |
| 3123.0 | 5.975 |
| 3124.0 | 5.92 |
| 3125.0 | 5.862 |
| 3126.0 | 5.812 |
| 3127.0 | 5.765 |
| 3128.0 | 5.715 |
| 3129.0 | 5.663 |
| 3130.0 | 5.612 |
| 3131.0 | 5.564 |
| 3132.0 | 5.516 |
| 3133.0 | 5.466 |
| 3134.0 | 5.411 |
| 3135.0 | 5.354 |
| 3136.0 | 5.3 |
| 3137.0 | 5.25 |
| 3138.0 | 5.208 |
| 3139.0 | 5.176 |
| 3140.0 | 5.148 |
| 3141.0 | 5.126 |
| 3142.0 | 5.118 |
| 3143.0 | 5.123 |
| 3144.0 | 5.137 |
| 3145.0 | 5.157 |
| 3146.0 | 5.182 |
| 3147.0 | 5.224 |
| 3148.0 | 5.272 |
| 3149.0 | 5.323 |
| 3150.0 | 5.387 |
| 3151.0 | 5.448 |
| 3152.0 | 5.505 |
| 3153.0 | 5.559 |
| 3154.0 | 5.626 |
| 3155.0 | 5.693 |
| 3156.0 | 5.765 |
| 3157.0 | 5.835 |
| 3158.0 | 5.921 |
| 3159.0 | 5.986 |
| 3160.0 | 6.05 |
| 3161.0 | 6.115 |
| 3162.0 | 6.18 |
| 3163.0 | 6.24 |
| 3164.0 | 6.298 |
| 3165.0 | 6.355 |
| 3166.0 | 6.411 |
| 3167.0 | 6.468 |
| 3168.0 | 6.552 |
| 3169.0 | 6.619 |
| 3170.0 | 6.667 |
| 3171.0 | 6.738 |
| 3172.0 | 6.776 |
| 3173.0 | 6.803 |
| 3174.0 | 6.837 |
| 3175.0 | 6.87 |
| 3176.0 | 6.895 |
| 3177.0 | 6.899 |
| 3178.0 | 6.887 |
| 3179.0 | 6.881 |
| 3180.0 | 6.881 |
| 3181.0 | 6.877 |
| 3182.0 | 6.863 |
| 3183.0 | 6.847 |
| 3184.0 | 6.832 |
| 3185.0 | 6.819 |
| 3186.0 | 6.805 |
| 3187.0 | 6.782 |
| 3188.0 | 6.745 |
| 3189.0 | 6.708 |
| 3190.0 | 6.66 |
| 3191.0 | 6.602 |
| 3192.0 | 6.54 |
| 3193.0 | 6.474 |
| 3194.0 | 6.406 |
| 3195.0 | 6.342 |
| 3196.0 | 6.275 |
| 3197.0 | 6.211 |
| 3198.0 | 6.148 |
| 3199.0 | 6.087 |
| 3200.0 | 6.027 |
| 3201.0 | 5.963 |
| 3202.0 | 5.897 |
| 3203.0 | 5.833 |
| 3204.0 | 5.77 |
| 3205.0 | 5.705 |
| 3206.0 | 5.642 |
| 3207.0 | 5.579 |
| 3208.0 | 5.518 |
| 3209.0 | 5.457 |
| 3210.0 | 5.396 |
| 3211.0 | 5.336 |
| 3212.0 | 5.277 |
| 3213.0 | 5.218 |
| 3214.0 | 5.161 |
| 3215.0 | 5.104 |
| 3216.0 | 5.05 |
| 3217.0 | 4.994 |
| 3218.0 | 4.941 |
| 3219.0 | 4.89 |
| 3220.0 | 4.837 |
| 3221.0 | 4.789 |
| 3222.0 | 4.74 |
| 3223.0 | 4.693 |
| 3224.0 | 4.649 |
| 3225.0 | 4.603 |
| 3226.0 | 4.558 |
| 3227.0 | 4.516 |
| 3228.0 | 4.473 |
| 3229.0 | 4.431 |
| 3230.0 | 4.392 |
| 3231.0 | 4.353 |
| 3232.0 | 4.316 |
| 3233.0 | 4.28 |
| 3234.0 | 4.244 |
| 3235.0 | 4.21 |
| 3236.0 | 4.181 |
| 3237.0 | 4.157 |
| 3238.0 | 4.138 |
| 3239.0 | 4.123 |
| 3240.0 | 4.119 |
| 3241.0 | 4.135 |
| 3242.0 | 4.17 |
| 3243.0 | 4.207 |
| 3244.0 | 4.25 |
| 3245.0 | 4.299 |
| 3246.0 | 4.356 |
| 3247.0 | 4.398 |
| 3248.0 | 4.445 |
| 3249.0 | 4.506 |
| 3250.0 | 4.559 |
| 3251.0 | 4.633 |
| 3252.0 | 4.7 |
| 3253.0 | 4.769 |
| 3254.0 | 4.828 |
| 3255.0 | 4.917 |
| 3256.0 | 4.969 |
| 3257.0 | 5.084 |
| 3258.0 | 5.203 |
| 3259.0 | 5.309 |
| 3260.0 | 5.447 |
| 3261.0 | 5.569 |
| 3262.0 | 5.685 |
| 3263.0 | 5.839 |
| 3264.0 | 5.947 |
| 3265.0 | 6.033 |
| 3266.0 | 6.134 |
| 3267.0 | 6.212 |
| 3268.0 | 6.273 |
| 3269.0 | 6.33 |
| 3270.0 | 6.396 |
| 3271.0 | 6.441 |
| 3272.0 | 6.47 |
| 3273.0 | 6.497 |
| 3274.0 | 6.53 |
| 3275.0 | 6.533 |
| 3276.0 | 6.52 |
| 3277.0 | 6.505 |
| 3278.0 | 6.485 |
| 3279.0 | 6.466 |
| 3280.0 | 6.448 |
| 3281.0 | 6.422 |
| 3282.0 | 6.396 |
| 3283.0 | 6.37 |
| 3284.0 | 6.349 |
| 3285.0 | 6.327 |
| 3286.0 | 6.297 |
| 3287.0 | 6.268 |
| 3288.0 | 6.25 |
| 3289.0 | 6.232 |
| 3290.0 | 6.215 |
| 3291.0 | 6.202 |
| 3292.0 | 6.194 |
| 3293.0 | 6.192 |
| 3294.0 | 6.194 |
| 3295.0 | 6.201 |
| 3296.0 | 6.206 |
| 3297.0 | 6.213 |
| 3298.0 | 6.22 |
| 3299.0 | 6.222 |
| 3300.0 | 6.22 |
| 3301.0 | 6.214 |
| 3302.0 | 6.205 |
| 3303.0 | 6.189 |
| 3304.0 | 6.17 |
| 3305.0 | 6.151 |
| 3306.0 | 6.13 |
| 3307.0 | 6.101 |
| 3308.0 | 6.068 |
| 3309.0 | 6.028 |
| 3310.0 | 5.986 |
| 3311.0 | 5.945 |
| 3312.0 | 5.903 |
| 3313.0 | 5.857 |
| 3314.0 | 5.809 |
| 3315.0 | 5.761 |
| 3316.0 | 5.714 |
| 3317.0 | 5.673 |
| 3318.0 | 5.632 |
| 3319.0 | 5.589 |
| 3320.0 | 5.544 |
| 3321.0 | 5.5 |
| 3322.0 | 5.458 |
| 3323.0 | 5.412 |
| 3324.0 | 5.371 |
| 3325.0 | 5.329 |
| 3326.0 | 5.29 |
| 3327.0 | 5.247 |
| 3328.0 | 5.206 |
| 3329.0 | 5.167 |
| 3330.0 | 5.131 |
| 3331.0 | 5.095 |
| 3332.0 | 5.056 |
| 3333.0 | 5.024 |
| 3334.0 | 4.991 |
| 3335.0 | 4.976 |
| 3336.0 | 4.977 |
| 3337.0 | 4.992 |
| 3338.0 | 5.018 |
| 3339.0 | 5.068 |
| 3340.0 | 5.109 |
| 3341.0 | 5.141 |
| 3342.0 | 5.202 |
| 3343.0 | 5.269 |
| 3344.0 | 5.319 |
| 3345.0 | 5.373 |
| 3346.0 | 5.418 |
| 3347.0 | 5.452 |
| 3348.0 | 5.492 |
| 3349.0 | 5.552 |
| 3350.0 | 5.623 |
| 3351.0 | 5.703 |
| 3352.0 | 5.779 |
| 3353.0 | 5.897 |
| 3354.0 | 6.032 |
| 3355.0 | 6.163 |
| 3356.0 | 6.293 |
| 3357.0 | 6.426 |
| 3358.0 | 6.558 |
| 3359.0 | 6.685 |
| 3360.0 | 6.81 |
| 3361.0 | 6.922 |
| 3362.0 | 7.018 |
| 3363.0 | 7.087 |
| 3364.0 | 7.128 |
| 3365.0 | 7.177 |
| 3366.0 | 7.227 |
| 3367.0 | 7.262 |
| 3368.0 | 7.277 |
| 3369.0 | 7.266 |
| 3370.0 | 7.245 |
| 3371.0 | 7.218 |
| 3372.0 | 7.179 |
| 3373.0 | 7.14 |
| 3374.0 | 7.105 |
| 3375.0 | 7.066 |
| 3376.0 | 7.023 |
| 3377.0 | 6.988 |
| 3378.0 | 6.954 |
| 3379.0 | 6.92 |
| 3380.0 | 6.88 |
| 3381.0 | 6.839 |
| 3382.0 | 6.8 |
| 3383.0 | 6.758 |
| 3384.0 | 6.718 |
| 3385.0 | 6.673 |
| 3386.0 | 6.629 |
| 3387.0 | 6.587 |
| 3388.0 | 6.543 |
| 3389.0 | 6.5 |
| 3390.0 | 6.457 |
| 3391.0 | 6.417 |
| 3392.0 | 6.379 |
| 3393.0 | 6.336 |
| 3394.0 | 6.297 |
| 3395.0 | 6.258 |
| 3396.0 | 6.219 |
| 3397.0 | 6.176 |
| 3398.0 | 6.136 |
| 3399.0 | 6.093 |
| 3400.0 | 6.053 |
| 3401.0 | 6.011 |
| 3402.0 | 5.97 |
| 3403.0 | 5.927 |
| 3404.0 | 5.886 |
| 3405.0 | 5.842 |
| 3406.0 | 5.8 |
| 3407.0 | 5.757 |
| 3408.0 | 5.711 |
| 3409.0 | 5.669 |
| 3410.0 | 5.627 |
| 3411.0 | 5.583 |
| 3412.0 | 5.54 |
| 3413.0 | 5.497 |
| 3414.0 | 5.456 |
| 3415.0 | 5.413 |
| 3416.0 | 5.372 |
| 3417.0 | 5.332 |
| 3418.0 | 5.29 |
| 3419.0 | 5.248 |
| 3420.0 | 5.206 |
| 3421.0 | 5.164 |
| 3422.0 | 5.124 |
| 3423.0 | 5.08 |
| 3424.0 | 5.036 |
| 3425.0 | 4.994 |
| 3426.0 | 4.954 |
| 3427.0 | 4.911 |
| 3428.0 | 4.87 |
| 3429.0 | 4.831 |
| 3430.0 | 4.798 |
| 3431.0 | 4.769 |
| 3432.0 | 4.742 |
| 3433.0 | 4.719 |
| 3434.0 | 4.704 |
| 3435.0 | 4.717 |
| 3436.0 | 4.733 |
| 3437.0 | 4.746 |
| 3438.0 | 4.765 |
| 3439.0 | 4.791 |
| 3440.0 | 4.821 |
| 3441.0 | 4.853 |
| 3442.0 | 4.888 |
| 3443.0 | 4.92 |
| 3444.0 | 4.964 |
| 3445.0 | 5.026 |
| 3446.0 | 5.099 |
| 3447.0 | 5.179 |
| 3448.0 | 5.263 |
| 3449.0 | 5.388 |
| 3450.0 | 5.535 |
| 3451.0 | 5.677 |
| 3452.0 | 5.817 |
| 3453.0 | 5.96 |
| 3454.0 | 6.105 |
| 3455.0 | 6.248 |
| 3456.0 | 6.384 |
| 3457.0 | 6.508 |
| 3458.0 | 6.613 |
| 3459.0 | 6.689 |
| 3460.0 | 6.741 |
| 3461.0 | 6.802 |
| 3462.0 | 6.847 |
| 3463.0 | 6.876 |
| 3464.0 | 6.887 |
| 3465.0 | 6.878 |
| 3466.0 | 6.865 |
| 3467.0 | 6.839 |
| 3468.0 | 6.801 |
| 3469.0 | 6.752 |
| 3470.0 | 6.702 |
| 3471.0 | 6.651 |
| 3472.0 | 6.603 |
| 3473.0 | 6.556 |
| 3474.0 | 6.51 |
| 3475.0 | 6.465 |
| 3476.0 | 6.418 |
| 3477.0 | 6.37 |
| 3478.0 | 6.323 |
| 3479.0 | 6.277 |
| 3480.0 | 6.23 |
| 3481.0 | 6.185 |
| 3482.0 | 6.138 |
| 3483.0 | 6.09 |
| 3484.0 | 6.047 |
| 3485.0 | 6.008 |
| 3486.0 | 5.962 |
| 3487.0 | 5.92 |
| 3488.0 | 5.877 |
| 3489.0 | 5.833 |
| 3490.0 | 5.79 |
| 3491.0 | 5.749 |
| 3492.0 | 5.705 |
| 3493.0 | 5.662 |
| 3494.0 | 5.622 |
| 3495.0 | 5.581 |
| 3496.0 | 5.543 |
| 3497.0 | 5.502 |
| 3498.0 | 5.464 |
| 3499.0 | 5.422 |
| 3500.0 | 5.386 |
| 3501.0 | 5.347 |
| 3502.0 | 5.31 |
| 3503.0 | 5.269 |
| 3504.0 | 5.232 |
| 3505.0 | 5.198 |
| 3506.0 | 5.163 |
| 3507.0 | 5.127 |
| 3508.0 | 5.091 |
| 3509.0 | 5.06 |
| 3510.0 | 5.025 |
| 3511.0 | 4.99 |
| 3512.0 | 4.956 |
| 3513.0 | 4.921 |
| 3514.0 | 4.887 |
| 3515.0 | 4.857 |
| 3516.0 | 4.823 |
| 3517.0 | 4.79 |
| 3518.0 | 4.757 |
| 3519.0 | 4.724 |
| 3520.0 | 4.69 |
| 3521.0 | 4.654 |
| 3522.0 | 4.621 |
| 3523.0 | 4.588 |
| 3524.0 | 4.558 |
| 3525.0 | 4.528 |
| 3526.0 | 4.503 |
| 3527.0 | 4.485 |
| 3528.0 | 4.467 |
| 3529.0 | 4.451 |
| 3530.0 | 4.442 |
| 3531.0 | 4.457 |
| 3532.0 | 4.485 |
| 3533.0 | 4.509 |
| 3534.0 | 4.538 |
| 3535.0 | 4.572 |
| 3536.0 | 4.611 |
| 3537.0 | 4.653 |
| 3538.0 | 4.695 |
| 3539.0 | 4.736 |
| 3540.0 | 4.785 |
| 3541.0 | 4.85 |
| 3542.0 | 4.932 |
| 3543.0 | 5.025 |
| 3544.0 | 5.119 |
| 3545.0 | 5.254 |
| 3546.0 | 5.412 |
| 3547.0 | 5.569 |
| 3548.0 | 5.724 |
| 3549.0 | 5.888 |
| 3550.0 | 6.054 |
| 3551.0 | 6.225 |
| 3552.0 | 6.4 |
| 3553.0 | 6.553 |
| 3554.0 | 6.673 |
| 3555.0 | 6.784 |
| 3556.0 | 6.881 |
| 3557.0 | 6.953 |
| 3558.0 | 7.019 |
| 3559.0 | 7.075 |
| 3560.0 | 7.105 |
| 3561.0 | 7.124 |
| 3562.0 | 7.134 |
| 3563.0 | 7.134 |
| 3564.0 | 7.114 |
| 3565.0 | 7.086 |
| 3566.0 | 7.053 |
| 3567.0 | 7.022 |
| 3568.0 | 6.993 |
| 3569.0 | 6.963 |
| 3570.0 | 6.928 |
| 3571.0 | 6.896 |
| 3572.0 | 6.862 |
| 3573.0 | 6.834 |
| 3574.0 | 6.818 |
| 3575.0 | 6.797 |
| 3576.0 | 6.77 |
| 3577.0 | 6.758 |
| 3578.0 | 6.743 |
| 3579.0 | 6.723 |
| 3580.0 | 6.709 |
| 3581.0 | 6.698 |
| 3582.0 | 6.702 |
| 3583.0 | 6.717 |
| 3584.0 | 6.729 |
| 3585.0 | 6.744 |
| 3586.0 | 6.764 |
| 3587.0 | 6.77 |
| 3588.0 | 6.762 |
| 3589.0 | 6.751 |
| 3590.0 | 6.735 |
| 3591.0 | 6.717 |
| 3592.0 | 6.692 |
| 3593.0 | 6.667 |
| 3594.0 | 6.657 |
| 3595.0 | 6.653 |
| 3596.0 | 6.652 |
| 3597.0 | 6.677 |
| 3598.0 | 6.718 |
| 3599.0 | 6.756 |
| 3600.0 | 6.777 |
| 3601.0 | 6.804 |
| 3602.0 | 6.831 |
| 3603.0 | 6.861 |
| 3604.0 | 6.882 |
| 3605.0 | 6.893 |
| 3606.0 | 6.903 |
| 3607.0 | 6.921 |
| 3608.0 | 6.927 |
| 3609.0 | 6.927 |
| 3610.0 | 6.928 |
| 3611.0 | 6.95 |
| 3612.0 | 6.973 |
| 3613.0 | 6.976 |
| 3614.0 | 6.972 |
| 3615.0 | 6.97 |
| 3616.0 | 6.971 |
| 3617.0 | 6.973 |
| 3618.0 | 6.972 |
| 3619.0 | 6.972 |
| 3620.0 | 6.968 |
| 3621.0 | 6.96 |
| 3622.0 | 6.952 |
| 3623.0 | 6.946 |
| 3624.0 | 6.944 |
| 3625.0 | 6.944 |
| 3626.0 | 6.943 |
| 3627.0 | 6.94 |
| 3628.0 | 6.933 |
| 3629.0 | 6.916 |
| 3630.0 | 6.903 |
| 3631.0 | 6.9 |
| 3632.0 | 6.89 |
| 3633.0 | 6.881 |
| 3634.0 | 6.883 |
| 3635.0 | 6.882 |
| 3636.0 | 6.876 |
| 3637.0 | 6.877 |
| 3638.0 | 6.878 |
| 3639.0 | 6.882 |
| 3640.0 | 6.888 |
| 3641.0 | 6.9 |
| 3642.0 | 6.908 |
| 3643.0 | 6.912 |
| 3644.0 | 6.938 |
| 3645.0 | 6.996 |
| 3646.0 | 7.042 |
| 3647.0 | 7.059 |
| 3648.0 | 7.102 |
| 3649.0 | 7.143 |
| 3650.0 | 7.16 |
| 3651.0 | 7.196 |
| 3652.0 | 7.232 |
| 3653.0 | 7.246 |
| 3654.0 | 7.232 |
| 3655.0 | 7.228 |
| 3656.0 | 7.225 |
| 3657.0 | 7.217 |
| 3658.0 | 7.202 |
| 3659.0 | 7.187 |
| 3660.0 | 7.169 |
| 3661.0 | 7.136 |
| 3662.0 | 7.098 |
| 3663.0 | 7.059 |
| 3664.0 | 7.021 |
| 3665.0 | 6.98 |
| 3666.0 | 6.943 |
| 3667.0 | 6.892 |
| 3668.0 | 6.843 |
| 3669.0 | 6.808 |
| 3670.0 | 6.769 |
| 3671.0 | 6.713 |
| 3672.0 | 6.658 |
| 3673.0 | 6.596 |
| 3674.0 | 6.529 |
| 3675.0 | 6.462 |
| 3676.0 | 6.392 |
| 3677.0 | 6.32 |
| 3678.0 | 6.251 |
| 3679.0 | 6.184 |
| 3680.0 | 6.119 |
| 3681.0 | 6.062 |
| 3682.0 | 6.001 |
| 3683.0 | 5.941 |
| 3684.0 | 5.88 |
| 3685.0 | 5.824 |
| 3686.0 | 5.761 |
| 3687.0 | 5.699 |
| 3688.0 | 5.637 |
| 3689.0 | 5.574 |
| 3690.0 | 5.522 |
| 3691.0 | 5.471 |
| 3692.0 | 5.424 |
| 3693.0 | 5.379 |
| 3694.0 | 5.344 |
| 3695.0 | 5.317 |
| 3696.0 | 5.297 |
| 3697.0 | 5.287 |
| 3698.0 | 5.284 |
| 3699.0 | 5.282 |
| 3700.0 | 5.28 |
| 3701.0 | 5.275 |
| 3702.0 | 5.26 |
| 3703.0 | 5.244 |
| 3704.0 | 5.221 |
| 3705.0 | 5.192 |
| 3706.0 | 5.156 |
| 3707.0 | 5.114 |
| 3708.0 | 5.078 |
| 3709.0 | 5.044 |
| 3710.0 | 5.011 |
| 3711.0 | 4.974 |
| 3712.0 | 4.938 |
| 3713.0 | 4.896 |
| 3714.0 | 4.851 |
| 3715.0 | 4.803 |
| 3716.0 | 4.755 |
| 3717.0 | 4.71 |
| 3718.0 | 4.667 |
| 3719.0 | 4.631 |
| 3720.0 | 4.595 |
| 3721.0 | 4.564 |
| 3722.0 | 4.536 |
| 3723.0 | 4.519 |
| 3724.0 | 4.53 |
| 3725.0 | 4.532 |
| 3726.0 | 4.541 |
| 3727.0 | 4.558 |
| 3728.0 | 4.58 |
| 3729.0 | 4.608 |
| 3730.0 | 4.635 |
| 3731.0 | 4.66 |
| 3732.0 | 4.687 |
| 3733.0 | 4.732 |
| 3734.0 | 4.799 |
| 3735.0 | 4.875 |
| 3736.0 | 4.943 |
| 3737.0 | 5.06 |
| 3738.0 | 5.204 |
| 3739.0 | 5.337 |
| 3740.0 | 5.465 |
| 3741.0 | 5.593 |
| 3742.0 | 5.72 |
| 3743.0 | 5.84 |
| 3744.0 | 5.957 |
| 3745.0 | 6.065 |
| 3746.0 | 6.154 |
| 3747.0 | 6.217 |
| 3748.0 | 6.293 |
| 3749.0 | 6.384 |
| 3750.0 | 6.473 |
| 3751.0 | 6.532 |
| 3752.0 | 6.568 |
| 3753.0 | 6.596 |
| 3754.0 | 6.622 |
| 3755.0 | 6.63 |
| 3756.0 | 6.613 |
| 3757.0 | 6.591 |
| 3758.0 | 6.575 |
| 3759.0 | 6.55 |
| 3760.0 | 6.53 |
| 3761.0 | 6.513 |
| 3762.0 | 6.483 |
| 3763.0 | 6.449 |
| 3764.0 | 6.417 |
| 3765.0 | 6.39 |
| 3766.0 | 6.36 |
| 3767.0 | 6.337 |
| 3768.0 | 6.322 |
| 3769.0 | 6.308 |
| 3770.0 | 6.298 |
| 3771.0 | 6.289 |
| 3772.0 | 6.282 |
| 3773.0 | 6.278 |
| 3774.0 | 6.274 |
| 3775.0 | 6.273 |
| 3776.0 | 6.272 |
| 3777.0 | 6.271 |
| 3778.0 | 6.269 |
| 3779.0 | 6.265 |
| 3780.0 | 6.263 |
| 3781.0 | 6.263 |
| 3782.0 | 6.261 |
| 3783.0 | 6.263 |
| 3784.0 | 6.265 |
| 3785.0 | 6.27 |
| 3786.0 | 6.275 |
| 3787.0 | 6.282 |
| 3788.0 | 6.289 |
| 3789.0 | 6.295 |
| 3790.0 | 6.299 |
| 3791.0 | 6.302 |
| 3792.0 | 6.306 |
| 3793.0 | 6.311 |
| 3794.0 | 6.316 |
| 3795.0 | 6.321 |
| 3796.0 | 6.327 |
| 3797.0 | 6.332 |
| 3798.0 | 6.339 |
| 3799.0 | 6.346 |
| 3800.0 | 6.352 |
| 3801.0 | 6.355 |
| 3802.0 | 6.362 |
| 3803.0 | 6.37 |
| 3804.0 | 6.38 |
| 3805.0 | 6.389 |
| 3806.0 | 6.398 |
| 3807.0 | 6.408 |
| 3808.0 | 6.418 |
| 3809.0 | 6.429 |
| 3810.0 | 6.439 |
| 3811.0 | 6.446 |
| 3812.0 | 6.453 |
| 3813.0 | 6.459 |
| 3814.0 | 6.468 |
| 3815.0 | 6.478 |
| 3816.0 | 6.49 |
| 3817.0 | 6.505 |
| 3818.0 | 6.524 |
| 3819.0 | 6.553 |
| 3820.0 | 6.577 |
| 3821.0 | 6.607 |
| 3822.0 | 6.649 |
| 3823.0 | 6.705 |
| 3824.0 | 6.777 |
| 3825.0 | 6.852 |
| 3826.0 | 6.886 |
| 3827.0 | 6.927 |
| 3828.0 | 6.986 |
| 3829.0 | 7.046 |
| 3830.0 | 7.107 |
| 3831.0 | 7.162 |
| 3832.0 | 7.223 |
| 3833.0 | 7.272 |
| 3834.0 | 7.338 |
| 3835.0 | 7.452 |
| 3836.0 | 7.552 |
| 3837.0 | 7.649 |
| 3838.0 | 7.744 |
| 3839.0 | 7.848 |
| 3840.0 | 7.942 |
| 3841.0 | 8 |
| 3842.0 | 8.02 |
| 3843.0 | 8.03 |
| 3844.0 | 8.05 |
| 3845.0 | 8.05 |
| 3846.0 | 8.06 |
| 3847.0 | 8.05 |
| 3848.0 | 8.05 |
| 3849.0 | 8.04 |
| 3850.0 | 8.03 |
| 3851.0 | 8.01 |
| 3852.0 | 7.995 |
| 3853.0 | 7.979 |
| 3854.0 | 7.957 |
| 3855.0 | 7.931 |
| 3856.0 | 7.907 |
| 3857.0 | 7.885 |
| 3858.0 | 7.861 |
| 3859.0 | 7.837 |
| 3860.0 | 7.813 |
| 3861.0 | 7.79 |
| 3862.0 | 7.768 |
| 3863.0 | 7.743 |
| 3864.0 | 7.719 |
| 3865.0 | 7.697 |
| 3866.0 | 7.673 |
| 3867.0 | 7.648 |
| 3868.0 | 7.626 |
| 3869.0 | 7.605 |
| 3870.0 | 7.583 |
| 3871.0 | 7.558 |
| 3872.0 | 7.532 |
| 3873.0 | 7.505 |
| 3874.0 | 7.476 |
| 3875.0 | 7.453 |
| 3876.0 | 7.432 |
| 3877.0 | 7.412 |
| 3878.0 | 7.393 |
| 3879.0 | 7.375 |
| 3880.0 | 7.36 |
| 3881.0 | 7.345 |
| 3882.0 | 7.332 |
| 3883.0 | 7.319 |
| 3884.0 | 7.307 |
| 3885.0 | 7.296 |
| 3886.0 | 7.286 |
| 3887.0 | 7.275 |
| 3888.0 | 7.265 |
| 3889.0 | 7.254 |
| 3890.0 | 7.244 |
| 3891.0 | 7.233 |
| 3892.0 | 7.222 |
| 3893.0 | 7.211 |
| 3894.0 | 7.201 |
| 3895.0 | 7.192 |
| 3896.0 | 7.182 |
| 3897.0 | 7.173 |
| 3898.0 | 7.165 |
| 3899.0 | 7.158 |
| 3900.0 | 7.15 |
| 3901.0 | 7.142 |
| 3902.0 | 7.135 |
| 3903.0 | 7.128 |
| 3904.0 | 7.122 |
| 3905.0 | 7.115 |
| 3906.0 | 7.109 |
| 3907.0 | 7.103 |
| 3908.0 | 7.096 |
| 3909.0 | 7.091 |
| 3910.0 | 7.088 |
| 3911.0 | 7.087 |
| 3912.0 | 7.088 |
| 3913.0 | 7.092 |
| 3914.0 | 7.099 |
| 3915.0 | 7.11 |
| 3916.0 | 7.127 |
| 3917.0 | 7.148 |
| 3918.0 | 7.176 |
| 3919.0 | 7.217 |
| 3920.0 | 7.241 |
| 3921.0 | 7.27 |
| 3922.0 | 7.303 |
| 3923.0 | 7.334 |
| 3924.0 | 7.37 |
| 3925.0 | 7.406 |
| 3926.0 | 7.457 |
| 3927.0 | 7.505 |
| 3928.0 | 7.552 |
| 3929.0 | 7.592 |
| 3930.0 | 7.641 |
| 3931.0 | 7.692 |
| 3932.0 | 7.731 |
| 3933.0 | 7.766 |
| 3934.0 | 7.83 |
| 3935.0 | 7.868 |
| 3936.0 | 7.912 |
| 3937.0 | 7.969 |
| 3938.0 | 8.02 |
| 3939.0 | 8.05 |
| 3940.0 | 8.05 |
| 3941.0 | 8.08 |
| 3942.0 | 8.1 |
| 3943.0 | 8.11 |
| 3944.0 | 8.12 |
| 3945.0 | 8.13 |
| 3946.0 | 8.12 |
| 3947.0 | 8.1 |
| 3948.0 | 8.08 |
| 3949.0 | 8.04 |
| 3950.0 | 7.991 |
| 3951.0 | 7.938 |
| 3952.0 | 7.882 |
| 3953.0 | 7.817 |
| 3954.0 | 7.75 |
| 3955.0 | 7.676 |
| 3956.0 | 7.602 |
| 3957.0 | 7.528 |
| 3958.0 | 7.452 |
| 3959.0 | 7.378 |
| 3960.0 | 7.307 |
| 3961.0 | 7.239 |
| 3962.0 | 7.178 |
| 3963.0 | 7.124 |
| 3964.0 | 7.083 |
| 3965.0 | 7.051 |
| 3966.0 | 7.026 |
| 3967.0 | 7.013 |
| 3968.0 | 7.009 |
| 3969.0 | 7.009 |
| 3970.0 | 7.012 |
| 3971.0 | 7.02 |
| 3972.0 | 7.027 |
| 3973.0 | 7.03 |
| 3974.0 | 7.028 |
| 3975.0 | 7.03 |
| 3976.0 | 7.033 |
| 3977.0 | 7.036 |
| 3978.0 | 7.041 |
| 3979.0 | 7.045 |
| 3980.0 | 7.048 |
| 3981.0 | 7.051 |
| 3982.0 | 7.052 |
| 3983.0 | 7.05 |
| 3984.0 | 7.046 |
| 3985.0 | 7.041 |
| 3986.0 | 7.036 |
| 3987.0 | 7.034 |
| 3988.0 | 7.034 |
| 3989.0 | 7.034 |
| 3990.0 | 7.033 |
| 3991.0 | 7.031 |
| 3992.0 | 7.029 |
| 3993.0 | 7.028 |
| 3994.0 | 7.026 |
| 3995.0 | 7.022 |
| 3996.0 | 7.019 |
| 3997.0 | 7.014 |
| 3998.0 | 7.007 |
| 3999.0 | 7 |
| 4000.0 | 6.993 |
| 4001.0 | 6.986 |
| 4002.0 | 6.977 |
| 4003.0 | 6.966 |
| 4004.0 | 6.957 |
| 4005.0 | 6.946 |
| 4006.0 | 6.938 |
| 4007.0 | 6.935 |
| 4008.0 | 6.932 |
| 4009.0 | 6.93 |
| 4010.0 | 6.938 |
| 4011.0 | 6.961 |
| 4012.0 | 6.981 |
| 4013.0 | 6.987 |
| 4014.0 | 6.995 |
| 4015.0 | 7.013 |
| 4016.0 | 7.037 |
| 4017.0 | 7.065 |
| 4018.0 | 7.086 |
| 4019.0 | 7.108 |
| 4020.0 | 7.125 |
| 4021.0 | 7.146 |
| 4022.0 | 7.179 |
| 4023.0 | 7.202 |
| 4024.0 | 7.221 |
| 4025.0 | 7.25 |
| 4026.0 | 7.266 |
| 4027.0 | 7.288 |
| 4028.0 | 7.31 |
| 4029.0 | 7.344 |
| 4030.0 | 7.384 |
| 4031.0 | 7.42 |
| 4032.0 | 7.455 |
| 4033.0 | 7.494 |
| 4034.0 | 7.513 |
| 4035.0 | 7.51 |
| 4036.0 | 7.521 |
| 4037.0 | 7.538 |
| 4038.0 | 7.533 |
| 4039.0 | 7.519 |
| 4040.0 | 7.511 |
| 4041.0 | 7.516 |
| 4042.0 | 7.517 |
| 4043.0 | 7.509 |
| 4044.0 | 7.487 |
| 4045.0 | 7.458 |
| 4046.0 | 7.429 |
| 4047.0 | 7.414 |
| 4048.0 | 7.393 |
| 4049.0 | 7.384 |
| 4050.0 | 7.375 |
| 4051.0 | 7.372 |
| 4052.0 | 7.365 |
| 4053.0 | 7.349 |
| 4054.0 | 7.356 |
| 4055.0 | 7.363 |
| 4056.0 | 7.367 |
| 4057.0 | 7.358 |
| 4058.0 | 7.353 |
| 4059.0 | 7.345 |
| 4060.0 | 7.329 |
| 4061.0 | 7.3 |
| 4062.0 | 7.281 |
| 4063.0 | 7.246 |
| 4064.0 | 7.205 |
| 4065.0 | 7.171 |
| 4066.0 | 7.148 |
| 4067.0 | 7.122 |
| 4068.0 | 7.075 |
| 4069.0 | 7.035 |
| 4070.0 | 6.995 |
| 4071.0 | 6.95 |
| 4072.0 | 6.905 |
| 4073.0 | 6.854 |
| 4074.0 | 6.802 |
| 4075.0 | 6.756 |
| 4076.0 | 6.707 |
| 4077.0 | 6.66 |
| 4078.0 | 6.631 |
| 4079.0 | 6.606 |
| 4080.0 | 6.586 |
| 4081.0 | 6.572 |
| 4082.0 | 6.555 |
| 4083.0 | 6.541 |
| 4084.0 | 6.55 |
| 4085.0 | 6.564 |
| 4086.0 | 6.565 |
| 4087.0 | 6.556 |
| 4088.0 | 6.547 |
| 4089.0 | 6.541 |
| 4090.0 | 6.532 |
| 4091.0 | 6.527 |
| 4092.0 | 6.523 |
| 4093.0 | 6.519 |
| 4094.0 | 6.514 |
| 4095.0 | 6.512 |
| 4096.0 | 6.505 |
| 4097.0 | 6.499 |
| 4098.0 | 6.488 |
| 4099.0 | 6.475 |
| 4100.0 | 6.464 |
| 4101.0 | 6.452 |
| 4102.0 | 6.44 |
| 4103.0 | 6.423 |
| 4104.0 | 6.394 |
| 4105.0 | 6.367 |
| 4106.0 | 6.353 |
| 4107.0 | 6.365 |
| 4108.0 | 6.377 |
| 4109.0 | 6.39 |
| 4110.0 | 6.397 |
| 4111.0 | 6.413 |
| 4112.0 | 6.473 |
| 4113.0 | 6.466 |
| 4114.0 | 6.459 |
| 4115.0 | 6.464 |
| 4116.0 | 6.483 |
| 4117.0 | 6.467 |
| 4118.0 | 6.47 |
| 4119.0 | 6.5 |
| 4120.0 | 6.534 |
| 4121.0 | 6.549 |
| 4122.0 | 6.553 |
| 4123.0 | 6.577 |
| 4124.0 | 6.671 |
| 4125.0 | 6.713 |
| 4126.0 | 6.724 |
| 4127.0 | 6.756 |
| 4128.0 | 6.796 |
| 4129.0 | 6.809 |
| 4130.0 | 6.819 |
| 4131.0 | 6.828 |
| 4132.0 | 6.834 |
| 4133.0 | 6.82 |
| 4134.0 | 6.796 |
| 4135.0 | 6.769 |
| 4136.0 | 6.755 |
| 4137.0 | 6.747 |
| 4138.0 | 6.716 |
| 4139.0 | 6.671 |
| 4140.0 | 6.621 |
| 4141.0 | 6.577 |
| 4142.0 | 6.516 |
| 4143.0 | 6.467 |
| 4144.0 | 6.433 |
| 4145.0 | 6.387 |
| 4146.0 | 6.33 |
| 4147.0 | 6.273 |
| 4148.0 | 6.211 |
| 4149.0 | 6.158 |
| 4150.0 | 6.095 |
| 4151.0 | 6.019 |
| 4152.0 | 5.954 |
| 4153.0 | 5.893 |
| 4154.0 | 5.842 |
| 4155.0 | 5.796 |
| 4156.0 | 5.752 |
| 4157.0 | 5.71 |
| 4158.0 | 5.661 |
| 4159.0 | 5.604 |
| 4160.0 | 5.557 |
| 4161.0 | 5.502 |
| 4162.0 | 5.449 |
| 4163.0 | 5.405 |
| 4164.0 | 5.372 |
| 4165.0 | 5.339 |
| 4166.0 | 5.309 |
| 4167.0 | 5.282 |
| 4168.0 | 5.263 |
| 4169.0 | 5.245 |
| 4170.0 | 5.228 |
| 4171.0 | 5.214 |
| 4172.0 | 5.203 |
| 4173.0 | 5.18 |
| 4174.0 | 5.15 |
| 4175.0 | 5.122 |
| 4176.0 | 5.081 |
| 4177.0 | 5.042 |
| 4178.0 | 5.023 |
| 4179.0 | 4.999 |
| 4180.0 | 4.979 |
| 4181.0 | 4.962 |
| 4182.0 | 4.948 |
| 4183.0 | 4.93 |
| 4184.0 | 4.913 |
| 4185.0 | 4.897 |
| 4186.0 | 4.882 |
| 4187.0 | 4.856 |
| 4188.0 | 4.815 |
| 4189.0 | 4.767 |
| 4190.0 | 4.718 |
| 4191.0 | 4.676 |
| 4192.0 | 4.643 |
| 4193.0 | 4.612 |
| 4194.0 | 4.583 |
| 4195.0 | 4.551 |
| 4196.0 | 4.527 |
| 4197.0 | 4.503 |
| 4198.0 | 4.482 |
| 4199.0 | 4.469 |
| 4200.0 | 4.47 |
| 4201.0 | 4.48 |
| 4202.0 | 4.493 |
| 4203.0 | 4.515 |
| 4204.0 | 4.546 |
| 4205.0 | 4.593 |
| 4206.0 | 4.642 |
| 4207.0 | 4.685 |
| 4208.0 | 4.716 |
| 4209.0 | 4.741 |
| 4210.0 | 4.785 |
| 4211.0 | 4.858 |
| 4212.0 | 4.905 |
| 4213.0 | 4.944 |
| 4214.0 | 5.002 |
| 4215.0 | 5.031 |
| 4216.0 | 5.044 |
| 4217.0 | 5.129 |
| 4218.0 | 5.183 |
| 4219.0 | 5.258 |
| 4220.0 | 5.328 |
| 4221.0 | 5.379 |
| 4222.0 | 5.426 |
| 4223.0 | 5.474 |
| 4224.0 | 5.509 |
| 4225.0 | 5.544 |
| 4226.0 | 5.563 |
| 4227.0 | 5.563 |
| 4228.0 | 5.578 |
| 4229.0 | 5.581 |
| 4230.0 | 5.565 |
| 4231.0 | 5.557 |
| 4232.0 | 5.541 |
| 4233.0 | 5.532 |
| 4234.0 | 5.535 |
| 4235.0 | 5.528 |
| 4236.0 | 5.521 |
| 4237.0 | 5.51 |
| 4238.0 | 5.487 |
| 4239.0 | 5.46 |
| 4240.0 | 5.432 |
| 4241.0 | 5.399 |
| 4242.0 | 5.367 |
| 4243.0 | 5.332 |
| 4244.0 | 5.292 |
| 4245.0 | 5.255 |
| 4246.0 | 5.219 |
| 4247.0 | 5.18 |
| 4248.0 | 5.138 |
| 4249.0 | 5.094 |
| 4250.0 | 5.054 |
| 4251.0 | 5.015 |
| 4252.0 | 4.962 |
| 4253.0 | 4.897 |
| 4254.0 | 4.829 |
| 4255.0 | 4.76 |
| 4256.0 | 4.689 |
| 4257.0 | 4.615 |
| 4258.0 | 4.545 |
| 4259.0 | 4.477 |
| 4260.0 | 4.412 |
| 4261.0 | 4.346 |
| 4262.0 | 4.283 |
| 4263.0 | 4.223 |
| 4264.0 | 4.168 |
| 4265.0 | 4.113 |
| 4266.0 | 4.059 |
| 4267.0 | 4.008 |
| 4268.0 | 3.958 |
| 4269.0 | 3.909 |
| 4270.0 | 3.86 |
| 4271.0 | 3.817 |
| 4272.0 | 3.786 |
| 4273.0 | 3.762 |
| 4274.0 | 3.733 |
| 4275.0 | 3.706 |
| 4276.0 | 3.686 |
| 4277.0 | 3.674 |
| 4278.0 | 3.651 |
| 4279.0 | 3.643 |
| 4280.0 | 3.646 |
| 4281.0 | 3.649 |
| 4282.0 | 3.649 |
| 4283.0 | 3.654 |
| 4284.0 | 3.66 |
| 4285.0 | 3.665 |
| 4286.0 | 3.671 |
| 4287.0 | 3.677 |
| 4288.0 | 3.68 |
| 4289.0 | 3.673 |
| 4290.0 | 3.645 |
| 4291.0 | 3.619 |
| 4292.0 | 3.589 |
| 4293.0 | 3.557 |
| 4294.0 | 3.521 |
| 4295.0 | 3.496 |
| 4296.0 | 3.481 |
| 4297.0 | 3.465 |
| 4298.0 | 3.456 |
| 4299.0 | 3.434 |
| 4300.0 | 3.414 |
| 4301.0 | 3.415 |
| 4302.0 | 3.43 |
| 4303.0 | 3.434 |
| 4304.0 | 3.443 |
| 4305.0 | 3.463 |
| 4306.0 | 3.487 |
| 4307.0 | 3.504 |
| 4308.0 | 3.515 |
| 4309.0 | 3.557 |
| 4310.0 | 3.606 |
| 4311.0 | 3.65 |
| 4312.0 | 3.697 |
| 4313.0 | 3.79 |
| 4314.0 | 3.905 |
| 4315.0 | 4.016 |
| 4316.0 | 4.116 |
| 4317.0 | 4.228 |
| 4318.0 | 4.341 |
| 4319.0 | 4.443 |
| 4320.0 | 4.554 |
| 4321.0 | 4.627 |
| 4322.0 | 4.678 |
| 4323.0 | 4.741 |
| 4324.0 | 4.804 |
| 4325.0 | 4.863 |
| 4326.0 | 4.909 |
| 4327.0 | 4.933 |
| 4328.0 | 4.932 |
| 4329.0 | 4.934 |
| 4330.0 | 4.938 |
| 4331.0 | 4.923 |
| 4332.0 | 4.897 |
| 4333.0 | 4.86 |
| 4334.0 | 4.825 |
| 4335.0 | 4.799 |
| 4336.0 | 4.779 |
| 4337.0 | 4.761 |
| 4338.0 | 4.75 |
| 4339.0 | 4.745 |
| 4340.0 | 4.733 |
| 4341.0 | 4.722 |
| 4342.0 | 4.731 |
| 4343.0 | 4.732 |
| 4344.0 | 4.735 |
| 4345.0 | 4.748 |
| 4346.0 | 4.757 |
| 4347.0 | 4.752 |
| 4348.0 | 4.744 |
| 4349.0 | 4.753 |
| 4350.0 | 4.75 |
| 4351.0 | 4.729 |
| 4352.0 | 4.734 |
| 4353.0 | 4.746 |
| 4354.0 | 4.757 |
| 4355.0 | 4.771 |
| 4356.0 | 4.789 |
| 4357.0 | 4.812 |
| 4358.0 | 4.837 |
| 4359.0 | 4.859 |
| 4360.0 | 4.875 |
| 4361.0 | 4.887 |
| 4362.0 | 4.908 |
| 4363.0 | 4.927 |
| 4364.0 | 4.941 |
| 4365.0 | 4.956 |
| 4366.0 | 4.965 |
| 4367.0 | 4.977 |
| 4368.0 | 4.99 |
| 4369.0 | 4.993 |
| 4370.0 | 4.999 |
| 4371.0 | 5.014 |
| 4372.0 | 5.027 |
| 4373.0 | 5.041 |
| 4374.0 | 5.051 |
| 4375.0 | 5.055 |
| 4376.0 | 5.06 |
| 4377.0 | 5.056 |
| 4378.0 | 5.042 |
| 4379.0 | 5.028 |
| 4380.0 | 5.023 |
| 4381.0 | 5.003 |
| 4382.0 | 4.989 |
| 4383.0 | 4.987 |
| 4384.0 | 4.988 |
| 4385.0 | 4.988 |
| 4386.0 | 4.978 |
| 4387.0 | 4.979 |
| 4388.0 | 4.989 |
| 4389.0 | 4.996 |
| 4390.0 | 5.005 |
| 4391.0 | 5.02 |
| 4392.0 | 5.042 |
| 4393.0 | 5.072 |
| 4394.0 | 5.103 |
| 4395.0 | 5.14 |
| 4396.0 | 5.189 |
| 4397.0 | 5.248 |
| 4398.0 | 5.315 |
| 4399.0 | 5.357 |
| 4400.0 | 5.385 |
| 4401.0 | 5.415 |
| 4402.0 | 5.457 |
| 4403.0 | 5.501 |
| 4404.0 | 5.565 |
| 4405.0 | 5.659 |
| 4406.0 | 5.768 |
| 4407.0 | 5.841 |
| 4408.0 | 5.92 |
| 4409.0 | 5.998 |
| 4410.0 | 6.057 |
| 4411.0 | 6.14 |
| 4412.0 | 6.199 |
| 4413.0 | 6.249 |
| 4414.0 | 6.318 |
| 4415.0 | 6.406 |
| 4416.0 | 6.452 |
| 4417.0 | 6.493 |
| 4418.0 | 6.511 |
| 4419.0 | 6.54 |
| 4420.0 | 6.572 |
| 4421.0 | 6.608 |
| 4422.0 | 6.603 |
| 4423.0 | 6.608 |
| 4424.0 | 6.589 |
| 4425.0 | 6.561 |
| 4426.0 | 6.529 |
| 4427.0 | 6.488 |
| 4428.0 | 6.439 |
| 4429.0 | 6.385 |
| 4430.0 | 6.326 |
| 4431.0 | 6.267 |
| 4432.0 | 6.211 |
| 4433.0 | 6.153 |
| 4434.0 | 6.092 |
| 4435.0 | 6.029 |
| 4436.0 | 5.966 |
| 4437.0 | 5.903 |
| 4438.0 | 5.844 |
| 4439.0 | 5.802 |
| 4440.0 | 5.76 |
| 4441.0 | 5.722 |
| 4442.0 | 5.68 |
| 4443.0 | 5.644 |
| 4444.0 | 5.613 |
| 4445.0 | 5.578 |
| 4446.0 | 5.545 |
| 4447.0 | 5.509 |
| 4448.0 | 5.464 |
| 4449.0 | 5.421 |
| 4450.0 | 5.376 |
| 4451.0 | 5.327 |
| 4452.0 | 5.277 |
| 4453.0 | 5.234 |
| 4454.0 | 5.208 |
| 4455.0 | 5.18 |
| 4456.0 | 5.144 |
| 4457.0 | 5.106 |
| 4458.0 | 5.089 |
| 4459.0 | 5.081 |
| 4460.0 | 5.078 |
| 4461.0 | 5.075 |
| 4462.0 | 5.079 |
| 4463.0 | 5.088 |
| 4464.0 | 5.097 |
| 4465.0 | 5.108 |
| 4466.0 | 5.12 |
| 4467.0 | 5.132 |
| 4468.0 | 5.145 |
| 4469.0 | 5.158 |
| 4470.0 | 5.171 |
| 4471.0 | 5.18 |
| 4472.0 | 5.18 |
| 4473.0 | 5.186 |
| 4474.0 | 5.192 |
| 4475.0 | 5.19 |
| 4476.0 | 5.189 |
| 4477.0 | 5.188 |
| 4478.0 | 5.175 |
| 4479.0 | 5.158 |
| 4480.0 | 5.137 |
| 4481.0 | 5.109 |
| 4482.0 | 5.078 |
| 4483.0 | 5.052 |
| 4484.0 | 5.026 |
| 4485.0 | 4.993 |
| 4486.0 | 4.961 |
| 4487.0 | 4.935 |
| 4488.0 | 4.924 |
| 4489.0 | 4.915 |
| 4490.0 | 4.91 |
| 4491.0 | 4.922 |
| 4492.0 | 4.953 |
| 4493.0 | 5.001 |
| 4494.0 | 5.06 |
| 4495.0 | 5.121 |
| 4496.0 | 5.179 |
| 4497.0 | 5.257 |
| 4498.0 | 5.336 |
| 4499.0 | 5.393 |
| 4500.0 | 5.448 |
| 4501.0 | 5.519 |
| 4502.0 | 5.595 |
| 4503.0 | 5.698 |
| 4504.0 | 5.755 |
| 4505.0 | 5.801 |
| 4506.0 | 5.902 |
| 4507.0 | 5.992 |
| 4508.0 | 6.048 |
| 4509.0 | 6.109 |
| 4510.0 | 6.19 |
| 4511.0 | 6.271 |
| 4512.0 | 6.335 |
| 4513.0 | 6.398 |
| 4514.0 | 6.459 |
| 4515.0 | 6.51 |
| 4516.0 | 6.549 |
| 4517.0 | 6.595 |
| 4518.0 | 6.64 |
| 4519.0 | 6.673 |
| 4520.0 | 6.694 |
| 4521.0 | 6.71 |
| 4522.0 | 6.719 |
| 4523.0 | 6.722 |
| 4524.0 | 6.718 |
| 4525.0 | 6.708 |
| 4526.0 | 6.69 |
| 4527.0 | 6.67 |
| 4528.0 | 6.649 |
| 4529.0 | 6.626 |
| 4530.0 | 6.598 |
| 4531.0 | 6.567 |
| 4532.0 | 6.531 |
| 4533.0 | 6.496 |
| 4534.0 | 6.459 |
| 4535.0 | 6.422 |
| 4536.0 | 6.382 |
| 4537.0 | 6.348 |
| 4538.0 | 6.31 |
| 4539.0 | 6.266 |
| 4540.0 | 6.216 |
| 4541.0 | 6.175 |
| 4542.0 | 6.136 |
| 4543.0 | 6.098 |
| 4544.0 | 6.059 |
| 4545.0 | 6.021 |
| 4546.0 | 5.984 |
| 4547.0 | 5.946 |
| 4548.0 | 5.905 |
| 4549.0 | 5.863 |
| 4550.0 | 5.821 |
| 4551.0 | 5.781 |
| 4552.0 | 5.739 |
| 4553.0 | 5.696 |
| 4554.0 | 5.657 |
| 4555.0 | 5.622 |
| 4556.0 | 5.58 |
| 4557.0 | 5.541 |
| 4558.0 | 5.506 |
| 4559.0 | 5.47 |
| 4560.0 | 5.427 |
| 4561.0 | 5.388 |
| 4562.0 | 5.348 |
| 4563.0 | 5.305 |
| 4564.0 | 5.257 |
| 4565.0 | 5.21 |
| 4566.0 | 5.161 |
| 4567.0 | 5.112 |
| 4568.0 | 5.061 |
| 4569.0 | 5.013 |
| 4570.0 | 4.966 |
| 4571.0 | 4.918 |
| 4572.0 | 4.869 |
| 4573.0 | 4.822 |
| 4574.0 | 4.775 |
| 4575.0 | 4.734 |
| 4576.0 | 4.697 |
| 4577.0 | 4.658 |
| 4578.0 | 4.623 |
| 4579.0 | 4.589 |
| 4580.0 | 4.553 |
| 4581.0 | 4.515 |
| 4582.0 | 4.478 |
| 4583.0 | 4.443 |
| 4584.0 | 4.413 |
| 4585.0 | 4.384 |
| 4586.0 | 4.362 |
| 4587.0 | 4.341 |
| 4588.0 | 4.325 |
| 4589.0 | 4.315 |
| 4590.0 | 4.328 |
| 4591.0 | 4.354 |
| 4592.0 | 4.38 |
| 4593.0 | 4.41 |
| 4594.0 | 4.442 |
| 4595.0 | 4.469 |
| 4596.0 | 4.5 |
| 4597.0 | 4.561 |
| 4598.0 | 4.632 |
| 4599.0 | 4.688 |
| 4600.0 | 4.735 |
| 4601.0 | 4.848 |
| 4602.0 | 4.98 |
| 4603.0 | 5.105 |
| 4604.0 | 5.218 |
| 4605.0 | 5.328 |
| 4606.0 | 5.444 |
| 4607.0 | 5.557 |
| 4608.0 | 5.652 |
| 4609.0 | 5.728 |
| 4610.0 | 5.805 |
| 4611.0 | 5.896 |
| 4612.0 | 5.999 |
| 4613.0 | 6.084 |
| 4614.0 | 6.142 |
| 4615.0 | 6.202 |
| 4616.0 | 6.237 |
| 4617.0 | 6.246 |
| 4618.0 | 6.256 |
| 4619.0 | 6.231 |
| 4620.0 | 6.197 |
| 4621.0 | 6.169 |
| 4622.0 | 6.139 |
| 4623.0 | 6.1 |
| 4624.0 | 6.058 |
| 4625.0 | 6.013 |
| 4626.0 | 5.967 |
| 4627.0 | 5.918 |
| 4628.0 | 5.866 |
| 4629.0 | 5.813 |
| 4630.0 | 5.756 |
| 4631.0 | 5.703 |
| 4632.0 | 5.65 |
| 4633.0 | 5.598 |
| 4634.0 | 5.547 |
| 4635.0 | 5.496 |
| 4636.0 | 5.447 |
| 4637.0 | 5.399 |
| 4638.0 | 5.35 |
| 4639.0 | 5.304 |
| 4640.0 | 5.26 |
| 4641.0 | 5.215 |
| 4642.0 | 5.17 |
| 4643.0 | 5.124 |
| 4644.0 | 5.079 |
| 4645.0 | 5.035 |
| 4646.0 | 4.987 |
| 4647.0 | 4.941 |
| 4648.0 | 4.901 |
| 4649.0 | 4.868 |
| 4650.0 | 4.832 |
| 4651.0 | 4.806 |
| 4652.0 | 4.785 |
| 4653.0 | 4.751 |
| 4654.0 | 4.714 |
| 4655.0 | 4.676 |
| 4656.0 | 4.638 |
| 4657.0 | 4.594 |
| 4658.0 | 4.553 |
| 4659.0 | 4.513 |
| 4660.0 | 4.47 |
| 4661.0 | 4.428 |
| 4662.0 | 4.388 |
| 4663.0 | 4.352 |
| 4664.0 | 4.314 |
| 4665.0 | 4.275 |
| 4666.0 | 4.236 |
| 4667.0 | 4.201 |
| 4668.0 | 4.166 |
| 4669.0 | 4.131 |
| 4670.0 | 5.294 |
| 4671.0 | 5.339 |
| 4672.0 | 5.397 |
| 4673.0 | 5.444 |
| 4674.0 | 5.464 |
| 4675.0 | 5.481 |
| 4676.0 | 5.489 |
| 4677.0 | 5.504 |
| 4678.0 | 5.521 |
| 4679.0 | 5.523 |
| 4680.0 | 4.282 |
| 4681.0 | 4.081 |
| 4682.0 | 4.216 |
| 4683.0 | 4.703 |
| 4684.0 | 5.267 |
| 4685.0 | 4.723 |
| 4686.0 | 4.833 |
| 4687.0 | 4.906 |
| 4688.0 | 4.986 |
| 4689.0 | 5.056 |
| 4690.0 | 5.121 |
| 4691.0 | 5.199 |
| 4692.0 | 5.275 |
| 4693.0 | 5.347 |
| 4694.0 | 5.411 |
| 4695.0 | 5.459 |
| 4696.0 | 5.492 |
| 4697.0 | 5.528 |
| 4698.0 | 5.574 |
| 4699.0 | 5.628 |
| 4700.0 | 5.686 |
| 4701.0 | 5.749 |
| 4702.0 | 5.793 |
| 4703.0 | 5.814 |
| 4704.0 | 5.816 |
| 4705.0 | 5.808 |
| 4706.0 | 5.791 |
| 4707.0 | 5.776 |
| 4708.0 | 5.769 |
| 4709.0 | 5.764 |
| 4710.0 | 5.762 |
| 4711.0 | 5.752 |
| 4712.0 | 5.747 |
| 4713.0 | 5.748 |
| 4714.0 | 5.748 |
| 4715.0 | 5.75 |
| 4716.0 | 5.753 |
| 4717.0 | 5.756 |
| 4718.0 | 5.765 |
| 4719.0 | 5.776 |
| 4720.0 | 5.908 |
| 4721.0 | 6.442 |
| 4722.0 | 6.449 |
| 4723.0 | 6.467 |
| 4724.0 | 6.494 |
| 4725.0 | 6.542 |
| 4726.0 | 6.577 |
| 4727.0 | 6.603 |
| 4728.0 | 6.638 |
| 4729.0 | 6.67 |
| 4730.0 | 6.686 |
| 4731.0 | 6.684 |
| 4732.0 | 6.675 |
| 4733.0 | 6.668 |
| 4734.0 | 6.671 |
| 4735.0 | 6.673 |
| 4736.0 | 6.668 |
| 4737.0 | 6.644 |
| 4738.0 | 6.596 |
| 4739.0 | 6.535 |
| 4740.0 | 6.464 |
| 4741.0 | 6.382 |
| 4742.0 | 6.299 |
| 4743.0 | 6.22 |
| 4744.0 | 6.142 |
| 4745.0 | 6.067 |
| 4746.0 | 5.996 |
| 4747.0 | 5.923 |
| 4748.0 | 5.847 |
| 4749.0 | 5.773 |
| 4750.0 | 5.701 |
| 4751.0 | 5.635 |
| 4752.0 | 5.562 |
| 4753.0 | 5.495 |
| 4754.0 | 5.427 |
| 4755.0 | 5.361 |
| 4756.0 | 5.296 |
| 4757.0 | 5.234 |
| 4758.0 | 5.172 |
| 4759.0 | 5.115 |
| 4760.0 | 5.057 |
| 4761.0 | 4.999 |
| 4762.0 | 4.943 |
| 4763.0 | 4.886 |
| 4764.0 | 4.828 |
| 4765.0 | 4.771 |
| 4766.0 | 4.712 |
| 4767.0 | 4.656 |
| 4768.0 | 4.601 |
| 4769.0 | 4.543 |
| 4770.0 | 4.49 |
| 4771.0 | 4.437 |
| 4772.0 | 4.387 |
| 4773.0 | 4.338 |
| 4774.0 | 4.289 |
| 4775.0 | 4.238 |
| 4776.0 | 4.191 |
| 4777.0 | 4.145 |
| 4778.0 | 4.099 |
| 4779.0 | 4.054 |
| 4780.0 | 3.51 |
| 4781.0 | 3.251 |
| 4782.0 | 3.287 |
| 4783.0 | 3.333 |
| 4784.0 | 3.379 |
| 4785.0 | 3.422 |
| 4786.0 | 3.458 |
| 4787.0 | 3.538 |
| 4788.0 | 3.648 |
| 4789.0 | 3.75 |
| 4790.0 | 3.848 |
| 4791.0 | 3.951 |
| 4792.0 | 4.049 |
| 4793.0 | 4.14 |
| 4794.0 | 4.217 |
| 4795.0 | 4.288 |
| 4796.0 | 4.362 |
| 4797.0 | 4.445 |
| 4798.0 | 4.524 |
| 4799.0 | 4.586 |
| 4800.0 | 4.623 |
| 4801.0 | 4.632 |
| 4802.0 | 4.62 |
| 4803.0 | 4.592 |
| 4804.0 | 4.555 |
| 4805.0 | 4.515 |
| 4806.0 | 4.478 |
| 4807.0 | 4.438 |
| 4808.0 | 4.396 |
| 4809.0 | 4.359 |
| 4810.0 | 4.319 |
| 4811.0 | 4.277 |
| 4812.0 | 4.235 |
| 4813.0 | 4.196 |
| 4814.0 | 4.157 |
| 4815.0 | 4.118 |
| 4816.0 | 4.078 |
| 4817.0 | 4.04 |
| 4818.0 | 4.004 |
| 4819.0 | 3.966 |
| 4820.0 | 3.931 |
| 4821.0 | 3.895 |
| 4822.0 | 3.863 |
| 4823.0 | 3.831 |
| 4824.0 | 3.801 |
| 4825.0 | 3.768 |
| 4826.0 | 3.737 |
| 4827.0 | 3.706 |
| 4828.0 | 3.677 |
| 4829.0 | 3.647 |
| 4830.0 | 3.616 |
| 4831.0 | 3.589 |
| 4832.0 | 3.564 |
| 4833.0 | 3.538 |
| 4834.0 | 3.511 |
| 4835.0 | 3.488 |
| 4836.0 | 3.463 |
| 4837.0 | 3.443 |
| 4838.0 | 3.424 |
| 4839.0 | 3.421 |
| 4840.0 | 3.426 |
| 4841.0 | 3.434 |
| 4842.0 | 3.453 |
| 4843.0 | 3.467 |
| 4844.0 | 3.482 |
| 4845.0 | 3.496 |
| 4846.0 | 3.501 |
| 4847.0 | 3.505 |
| 4848.0 | 3.511 |
| 4849.0 | 3.515 |
| 4850.0 | 3.517 |
| 4851.0 | 3.516 |
| 4852.0 | 3.516 |
| 4853.0 | 3.519 |
| 4854.0 | 3.525 |
| 4855.0 | 3.533 |
| 4856.0 | 3.543 |
| 4857.0 | 3.553 |
| 4858.0 | 3.564 |
| 4859.0 | 3.575 |
| 4860.0 | 3.586 |
| 4861.0 | 3.598 |
| 4862.0 | 3.609 |
| 4863.0 | 3.619 |
| 4864.0 | 3.629 |
| 4865.0 | 3.638 |
| 4866.0 | 3.652 |
| 4867.0 | 3.673 |
| 4868.0 | 3.699 |
| 4869.0 | 3.725 |
| 4870.0 | 4.118 |
| 4871.0 | 4.25 |
| 4872.0 | 4.327 |
| 4873.0 | 4.395 |
| 4874.0 | 4.464 |
| 4875.0 | 4.533 |
| 4876.0 | 4.601 |
| 4877.0 | 4.665 |
| 4878.0 | 4.717 |
| 4879.0 | 4.761 |
| 4880.0 | 4.807 |
| 4881.0 | 4.854 |
| 4882.0 | 4.771 |
| 4883.0 | 4.311 |
| 4884.0 | 0.376 |
| 4885.0 | 0.359 |
| 4886.0 | 0.348 |
| 4887.0 | 0.333 |
| 4888.0 | 0.303 |
| 4889.0 | 0.289 |
| 4890.0 | 0.239 |
| 4891.0 | 0.222 |
| 4892.0 | 0.198 |
| 4893.0 | 0.236 |
| 4894.0 | 0.302 |
| 4895.0 | 0.347 |
| 4896.0 | 0.379 |
| 4897.0 | 0.388 |
| 4898.0 | 0.373 |
| 4899.0 | 0.343 |
| 4900.0 | 0.308 |
| 4901.0 | 0.296 |
| 4902.0 | 0.3 |
| 4903.0 | 0.278 |
| 4904.0 | 0.235 |
| 4905.0 | 0.181 |
| 4906.0 | 0.128 |
| 4907.0 | 0.078 |
| 4908.0 | 0.029 |
| 4909.0 | -0.015 |
| 4910.0 | -0.064 |
| 4911.0 | -0.098 |
| 4912.0 | -0.126 |
| 4913.0 | -0.141 |
| 4914.0 | -0.117 |
| 4915.0 | -0.11 |
| 4916.0 | -0.108 |
| 4917.0 | -0.108 |
| 4918.0 | -0.108 |
| 4919.0 | -0.108 |
| 4920.0 | -0.107 |
| 4921.0 | -0.106 |
| 4922.0 | -0.106 |
| 4923.0 | -0.108 |
| 4924.0 | -0.106 |
| 4925.0 | -0.1 |
| 4926.0 | -0.1 |
| 4927.0 | -0.1 |
| 4928.0 | -0.1 |
| 4929.0 | -0.1 |
| 4930.0 | -0.1 |
| 4931.0 | -0.1 |
| 4932.0 | -0.1 |
| 4933.0 | -0.1 |
| 4934.0 | -0.1 |
| 4935.0 | -0.1 |
| 4936.0 | -0.1 |
| 4937.0 | -0.1 |
| 4938.0 | -0.101 |
| 4939.0 | -0.101 |
| 4940.0 | -0.101 |
| 4941.0 | -0.101 |
| 4942.0 | -0.101 |
| 4943.0 | -0.102 |
| 4944.0 | -0.101 |
| 4945.0 | -0.102 |
| 4946.0 | -0.103 |
| 4947.0 | -0.108 |
| 4948.0 | -0.099 |
| 4949.0 | -0.098 |
| 4950.0 | -0.098 |
| 4951.0 | -0.098 |
| 4952.0 | -0.098 |
| 4953.0 | -0.097 |
| 4954.0 | -0.098 |
| 4955.0 | -0.098 |
| 4956.0 | -0.098 |
| 4957.0 | -0.099 |
| 4958.0 | -0.099 |
| 4959.0 | -0.098 |
| 4960.0 | -0.098 |
| 4961.0 | -0.099 |
| 4962.0 | -0.099 |
| 4963.0 | -0.099 |
| 4964.0 | -0.099 |
| 4965.0 | -0.099 |
| 4966.0 | -0.1 |
| 4967.0 | -0.1 |
| 4968.0 | -0.1 |
| 4969.0 | -0.102 |
| 4970.0 | 0.866 |
| 4971.0 | 0.875 |
| 4972.0 | 0.884 |
| 4973.0 | 0.89 |
| 4974.0 | -0.108 |
| 4975.0 | -0.101 |
| 4976.0 | -0.101 |
| 4977.0 | -0.101 |
| 4978.0 | -0.101 |
| 4979.0 | -0.1 |
| 4980.0 | -0.1 |
| 4981.0 | -0.101 |
| 4982.0 | -0.102 |
| 4983.0 | -0.103 |
| 4984.0 | -0.102 |
| 4985.0 | -0.102 |
| 4986.0 | -0.1 |
| 4987.0 | -0.1 |
| 4988.0 | -0.1 |
| 4989.0 | -0.1 |
| 4990.0 | -0.1 |
| 4991.0 | -0.1 |
| 4992.0 | -0.1 |
| 4993.0 | -0.1 |
| 4994.0 | 0.157 |
| 4995.0 | 0.165 |
| 4996.0 | 0.172 |
| 4997.0 | 0.187 |
| 4998.0 | 0.208 |
| 4999.0 | 0.217 |
| 5000.0 | 0.246 |
| 5001.0 | 0.269 |
| 5002.0 | 0.291 |
| 5003.0 | 0.318 |
| 5004.0 | 0.343 |
| 5005.0 | 0.375 |
| 5006.0 | 0.404 |
| 5007.0 | 0.431 |
| 5008.0 | 0.463 |
| 5009.0 | 0.496 |
| 5010.0 | 0.534 |
| 5011.0 | 0.575 |
| 5012.0 | 0.612 |
| 5013.0 | 0.652 |
| 5014.0 | 0.682 |
| 5015.0 | 1.237 |
| 5016.0 | 1.24 |
| 5017.0 | 1.245 |
| 5018.0 | 1.257 |
| 5019.0 | 1.268 |
| 5020.0 | 1.271 |
| 5021.0 | 1.28 |
| 5022.0 | 1.294 |
| 5023.0 | 1.307 |
| 5024.0 | 1.321 |
| 5025.0 | 1.338 |
| 5026.0 | 1.358 |
| 5027.0 | 1.373 |
| 5028.0 | 1.394 |
| 5029.0 | 1.425 |
| 5030.0 | 1.458 |
| 5031.0 | 1.491 |
| 5032.0 | 1.523 |
| 5033.0 | 1.548 |
| 5034.0 | 1.572 |
| 5035.0 | 1.587 |
| 5036.0 | 1.594 |
| 5037.0 | 2.651 |
| 5038.0 | 2.723 |
| 5039.0 | 2.749 |
| 5040.0 | 2.757 |
| 5041.0 | 2.78 |
| 5042.0 | 2.798 |
| 5043.0 | 2.789 |
| 5044.0 | 2.769 |
| 5045.0 | 1.819 |
| 5046.0 | 1.813 |
| 5047.0 | 1.81 |
| 5048.0 | 1.8 |
| 5049.0 | 1.798 |
| 5050.0 | 1.822 |
| 5051.0 | 1.865 |
| 5052.0 | 1.911 |
| 5053.0 | 1.954 |
| 5054.0 | 2.002 |
| 5055.0 | 2.049 |
| 5056.0 | 2.097 |
| 5057.0 | 2.147 |
| 5058.0 | 2.194 |
| 5059.0 | 2.24 |
| 5060.0 | 2.28 |
| 5061.0 | 2.319 |
| 5062.0 | 2.354 |
| 5063.0 | 2.381 |
| 5064.0 | 2.4 |
| 5065.0 | 2.415 |
| 5066.0 | 2.427 |
| 5067.0 | 2.437 |
| 5068.0 | 2.441 |
| 5069.0 | 2.446 |
| 5070.0 | 2.449 |
| 5071.0 | 2.447 |
| 5072.0 | 2.45 |
| 5073.0 | 2.448 |
| 5074.0 | 2.449 |
| 5075.0 | 2.448 |
| 5076.0 | 2.442 |
| 5077.0 | 2.438 |
| 5078.0 | 2.434 |
| 5079.0 | 2.429 |
| 5080.0 | 2.423 |
| 5081.0 | 2.416 |
| 5082.0 | 2.409 |
| 5083.0 | 2.404 |
| 5084.0 | 2.4 |
| 5085.0 | 2.396 |
| 5086.0 | 2.39 |
| 5087.0 | 2.389 |
| 5088.0 | 2.385 |
| 5089.0 | 2.382 |
| 5090.0 | 2.384 |
| 5091.0 | 2.381 |
| 5092.0 | 3.494 |
| 5093.0 | 3.56 |
| 5094.0 | 3.788 |
| 5095.0 | 4.32 |
| 5096.0 | 4.366 |
| 5097.0 | 4.394 |
| 5098.0 | 4.45 |
| 5099.0 | 4.484 |
| 5100.0 | 4.521 |
| 5101.0 | 4.582 |
| 5102.0 | 4.637 |
| 5103.0 | 4.664 |
| 5104.0 | 4.741 |
| 5105.0 | 4.675 |
| 5106.0 | 4.704 |
| 5107.0 | 4.83 |
| 5108.0 | 4.845 |
| 5109.0 | -0.106 |
| 5110.0 | -0.102 |
| 5111.0 | -0.102 |
| 5112.0 | -0.102 |
| 5113.0 | -0.102 |
| 5114.0 | -0.102 |
| 5115.0 | -0.102 |
| 5116.0 | -0.103 |
| 5117.0 | -0.103 |
| 5118.0 | -0.103 |
| 5119.0 | -0.103 |
| 5120.0 | -0.103 |
| 5121.0 | -0.104 |
| 5122.0 | -0.098 |
| 5123.0 | -0.098 |
| 5124.0 | -0.098 |
| 5125.0 | -0.098 |
| 5126.0 | -0.098 |
| 5127.0 | -0.098 |
| 5128.0 | -0.098 |
| 5129.0 | -0.098 |
| 5130.0 | -0.102 |
| 5131.0 | -0.107 |
| 5132.0 | -0.101 |
| 5133.0 | -0.098 |
| 5134.0 | -0.098 |
| 5135.0 | -0.097 |
| 5136.0 | 0.055 |
| 5137.0 | 0.56 |
| 5138.0 | 0.732 |
| 5139.0 | 0.834 |
| 5140.0 | 0.913 |
| 5141.0 | 0.969 |
| 5142.0 | 1.014 |
| 5143.0 | 1.041 |
| 5144.0 | 1.145 |
| 5145.0 | 1.873 |
| 5146.0 | 1.902 |
| 5147.0 | 1.943 |
| 5148.0 | 1.993 |
| 5149.0 | 2.038 |
| 5150.0 | 2.072 |
| 5151.0 | 2.104 |
| 5152.0 | 2.143 |
| 5153.0 | 2.194 |
| 5154.0 | 2.232 |
| 5155.0 | 2.284 |
| 5156.0 | 2.636 |
| 5157.0 | 2.678 |
| 5158.0 | 2.707 |
| 5159.0 | 2.733 |
| 5160.0 | 2.771 |
| 5161.0 | 2.795 |
| 5162.0 | 2.806 |
| 5163.0 | 2.816 |
| 5164.0 | 2.841 |
| 5165.0 | 2.872 |
| 5166.0 | 2.875 |
| 5167.0 | 2.872 |
| 5168.0 | 1.587 |
| 5169.0 | 1.597 |
| 5170.0 | 1.614 |
| 5171.0 | 1.629 |
| 5172.0 | 1.651 |
| 5173.0 | 1.68 |
| 5174.0 | 1.719 |
| 5175.0 | 1.763 |
| 5176.0 | 1.81 |
| 5177.0 | 1.854 |
| 5178.0 | 1.891 |
| 5179.0 | 1.927 |
| 5180.0 | 1.969 |
| 5181.0 | 2.017 |
| 5182.0 | 2.066 |
| 5183.0 | 2.108 |
| 5184.0 | 2.146 |
| 5185.0 | 2.183 |
| 5186.0 | 2.213 |
| 5187.0 | 2.226 |
| 5188.0 | 2.23 |
| 5189.0 | 2.223 |
| 5190.0 | 2.224 |
| 5191.0 | 2.688 |
| 5192.0 | 2.736 |
| 5193.0 | 2.799 |
| 5194.0 | 1.008 |
| 5195.0 | 1.027 |
| 5196.0 | 1.035 |
| 5197.0 | 1.04 |
| 5198.0 | 1.061 |
| 5199.0 | 1.546 |
| 5200.0 | 1.571 |
| 5201.0 | 1.598 |
| 5202.0 | 1.624 |
| 5203.0 | 1.637 |
| 5204.0 | 1.647 |
| 5205.0 | 1.689 |
| 5206.0 | -0.103 |
| 5207.0 | -0.101 |
| 5208.0 | -0.101 |
| 5209.0 | -0.1 |
| 5210.0 | -0.1 |
| 5211.0 | -0.1 |
| 5212.0 | -0.1 |
| 5213.0 | -0.101 |
| 5214.0 | -0.103 |
| 5215.0 | -0.106 |
| 5216.0 | 0.383 |
| 5217.0 | 0.438 |
| 5218.0 | 0.455 |
| 5219.0 | 0.485 |
| 5220.0 | 0.535 |
| 5221.0 | 0.568 |
| 5222.0 | 0.628 |
| 5223.0 | 0.675 |
| 5224.0 | 0.715 |
| 5225.0 | 0.769 |
| 5226.0 | 0.827 |
| 5227.0 | 0.883 |
| 5228.0 | 0.902 |
| 5229.0 | 0.947 |
| 5230.0 | 0.997 |
| 5231.0 | 0.995 |
| 5232.0 | 1.029 |
| 5233.0 | -0.102 |
| 5234.0 | -0.101 |
| 5235.0 | -0.107 |
| 5236.0 | -0.092 |
| 5237.0 | -0.071 |
| 5238.0 | -0.084 |
| 5239.0 | -0.077 |
| 5240.0 | -0.07 |
| 5241.0 | -0.063 |
| 5242.0 | -0.103 |
| 5243.0 | -0.127 |
| 5244.0 | -0.116 |
| 5245.0 | -0.109 |
| 5246.0 | -0.103 |
| 5247.0 | -0.094 |
| 5248.0 | -0.091 |
| 5249.0 | -0.095 |
| 5250.0 | -0.1 |
| 5251.0 | -0.096 |
| 5252.0 | -0.096 |
| 5253.0 | -0.097 |
| 5254.0 | -0.097 |
| 5255.0 | -0.098 |
| 5256.0 | -0.097 |
| 5257.0 | -0.098 |
| 5258.0 | -0.099 |
| 5259.0 | -0.096 |
| 5260.0 | -0.096 |
| 5261.0 | -0.096 |
| 5262.0 | -0.096 |
| 5263.0 | -0.096 |
| 5264.0 | -0.095 |
| 5265.0 | -0.094 |